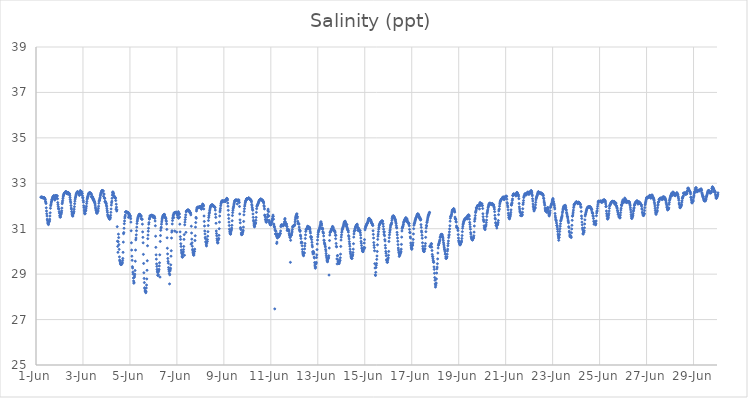
| Category | Salinity (ppt) |
|---|---|
| 44348.208333333336 | 32.39 |
| 44348.21875 | 32.39 |
| 44348.229166666664 | 32.38 |
| 44348.239583333336 | 32.39 |
| 44348.25 | 32.39 |
| 44348.260416666664 | 32.39 |
| 44348.270833333336 | 32.38 |
| 44348.28125 | 32.36 |
| 44348.291666666664 | 32.37 |
| 44348.302083333336 | 32.36 |
| 44348.3125 | 32.36 |
| 44348.322916666664 | 32.37 |
| 44348.333333333336 | 32.36 |
| 44348.34375 | 32.37 |
| 44348.354166666664 | 32.36 |
| 44348.364583333336 | 32.35 |
| 44348.375 | 32.31 |
| 44348.385416666664 | 32.31 |
| 44348.395833333336 | 32.28 |
| 44348.40625 | 32.2 |
| 44348.416666666664 | 32.17 |
| 44348.427083333336 | 32.11 |
| 44348.4375 | 31.92 |
| 44348.447916666664 | 31.78 |
| 44348.458333333336 | 31.66 |
| 44348.46875 | 31.56 |
| 44348.479166666664 | 31.42 |
| 44348.489583333336 | 31.36 |
| 44348.5 | 31.29 |
| 44348.510416666664 | 31.22 |
| 44348.520833333336 | 31.22 |
| 44348.53125 | 31.18 |
| 44348.541666666664 | 31.27 |
| 44348.552083333336 | 31.32 |
| 44348.5625 | 31.31 |
| 44348.572916666664 | 31.35 |
| 44348.583333333336 | 31.42 |
| 44348.59375 | 31.56 |
| 44348.604166666664 | 31.7 |
| 44348.614583333336 | 31.9 |
| 44348.625 | 32.01 |
| 44348.635416666664 | 32.06 |
| 44348.645833333336 | 32.13 |
| 44348.65625 | 32.18 |
| 44348.666666666664 | 32.22 |
| 44348.677083333336 | 32.28 |
| 44348.6875 | 32.28 |
| 44348.697916666664 | 32.33 |
| 44348.708333333336 | 32.38 |
| 44348.71875 | 32.39 |
| 44348.729166666664 | 32.41 |
| 44348.739583333336 | 32.43 |
| 44348.75 | 32.45 |
| 44348.760416666664 | 32.44 |
| 44348.770833333336 | 32.44 |
| 44348.78125 | 32.44 |
| 44348.791666666664 | 32.3 |
| 44348.802083333336 | 32.26 |
| 44348.8125 | 32.33 |
| 44348.822916666664 | 32.41 |
| 44348.833333333336 | 32.46 |
| 44348.84375 | 32.46 |
| 44348.854166666664 | 32.45 |
| 44348.864583333336 | 32.44 |
| 44348.875 | 32.44 |
| 44348.885416666664 | 32.34 |
| 44348.895833333336 | 32.45 |
| 44348.90625 | 32.44 |
| 44348.916666666664 | 32.32 |
| 44348.927083333336 | 32.15 |
| 44348.9375 | 32.06 |
| 44348.947916666664 | 31.97 |
| 44348.958333333336 | 31.88 |
| 44348.96875 | 31.88 |
| 44348.979166666664 | 31.87 |
| 44348.989583333336 | 31.75 |
| 44349.0 | 31.68 |
| 44349.010416666664 | 31.58 |
| 44349.020833333336 | 31.52 |
| 44349.03125 | 31.51 |
| 44349.041666666664 | 31.52 |
| 44349.052083333336 | 31.61 |
| 44349.0625 | 31.64 |
| 44349.072916666664 | 31.66 |
| 44349.083333333336 | 31.72 |
| 44349.09375 | 31.79 |
| 44349.104166666664 | 31.91 |
| 44349.114583333336 | 32.1 |
| 44349.125 | 32.17 |
| 44349.135416666664 | 32.24 |
| 44349.145833333336 | 32.33 |
| 44349.15625 | 32.4 |
| 44349.166666666664 | 32.45 |
| 44349.177083333336 | 32.49 |
| 44349.1875 | 32.52 |
| 44349.197916666664 | 32.55 |
| 44349.208333333336 | 32.56 |
| 44349.21875 | 32.58 |
| 44349.229166666664 | 32.58 |
| 44349.239583333336 | 32.6 |
| 44349.25 | 32.62 |
| 44349.260416666664 | 32.63 |
| 44349.270833333336 | 32.63 |
| 44349.28125 | 32.62 |
| 44349.291666666664 | 32.62 |
| 44349.302083333336 | 32.59 |
| 44349.3125 | 32.56 |
| 44349.322916666664 | 32.54 |
| 44349.333333333336 | 32.54 |
| 44349.34375 | 32.54 |
| 44349.354166666664 | 32.6 |
| 44349.364583333336 | 32.6 |
| 44349.375 | 32.59 |
| 44349.385416666664 | 32.57 |
| 44349.395833333336 | 32.54 |
| 44349.40625 | 32.52 |
| 44349.416666666664 | 32.55 |
| 44349.427083333336 | 32.54 |
| 44349.4375 | 32.47 |
| 44349.447916666664 | 32.38 |
| 44349.458333333336 | 32.29 |
| 44349.46875 | 32.21 |
| 44349.479166666664 | 32.14 |
| 44349.489583333336 | 32.02 |
| 44349.5 | 31.91 |
| 44349.510416666664 | 31.86 |
| 44349.520833333336 | 31.76 |
| 44349.53125 | 31.69 |
| 44349.541666666664 | 31.63 |
| 44349.552083333336 | 31.58 |
| 44349.5625 | 31.56 |
| 44349.572916666664 | 31.56 |
| 44349.583333333336 | 31.65 |
| 44349.59375 | 31.69 |
| 44349.604166666664 | 31.7 |
| 44349.614583333336 | 31.76 |
| 44349.625 | 31.86 |
| 44349.635416666664 | 31.97 |
| 44349.645833333336 | 32.1 |
| 44349.65625 | 32.21 |
| 44349.666666666664 | 32.3 |
| 44349.677083333336 | 32.36 |
| 44349.6875 | 32.4 |
| 44349.697916666664 | 32.45 |
| 44349.708333333336 | 32.5 |
| 44349.71875 | 32.54 |
| 44349.729166666664 | 32.56 |
| 44349.739583333336 | 32.57 |
| 44349.75 | 32.59 |
| 44349.760416666664 | 32.63 |
| 44349.770833333336 | 32.62 |
| 44349.78125 | 32.62 |
| 44349.791666666664 | 32.6 |
| 44349.802083333336 | 32.59 |
| 44349.8125 | 32.56 |
| 44349.822916666664 | 32.55 |
| 44349.833333333336 | 32.54 |
| 44349.84375 | 32.47 |
| 44349.854166666664 | 32.48 |
| 44349.864583333336 | 32.6 |
| 44349.875 | 32.62 |
| 44349.885416666664 | 32.68 |
| 44349.895833333336 | 32.64 |
| 44349.90625 | 32.65 |
| 44349.916666666664 | 32.6 |
| 44349.927083333336 | 32.6 |
| 44349.9375 | 32.53 |
| 44349.947916666664 | 32.56 |
| 44349.958333333336 | 32.62 |
| 44349.96875 | 32.55 |
| 44349.979166666664 | 32.45 |
| 44349.989583333336 | 32.36 |
| 44350.0 | 32.36 |
| 44350.010416666664 | 32.25 |
| 44350.020833333336 | 32.17 |
| 44350.03125 | 32.01 |
| 44350.041666666664 | 31.93 |
| 44350.052083333336 | 31.82 |
| 44350.0625 | 31.74 |
| 44350.072916666664 | 31.67 |
| 44350.083333333336 | 31.65 |
| 44350.09375 | 31.68 |
| 44350.104166666664 | 31.78 |
| 44350.114583333336 | 31.79 |
| 44350.125 | 31.82 |
| 44350.135416666664 | 31.91 |
| 44350.145833333336 | 31.99 |
| 44350.15625 | 32.11 |
| 44350.166666666664 | 32.2 |
| 44350.177083333336 | 32.3 |
| 44350.1875 | 32.34 |
| 44350.197916666664 | 32.39 |
| 44350.208333333336 | 32.42 |
| 44350.21875 | 32.46 |
| 44350.229166666664 | 32.5 |
| 44350.239583333336 | 32.53 |
| 44350.25 | 32.56 |
| 44350.260416666664 | 32.57 |
| 44350.270833333336 | 32.58 |
| 44350.28125 | 32.57 |
| 44350.291666666664 | 32.58 |
| 44350.302083333336 | 32.58 |
| 44350.3125 | 32.57 |
| 44350.322916666664 | 32.56 |
| 44350.333333333336 | 32.56 |
| 44350.34375 | 32.55 |
| 44350.354166666664 | 32.41 |
| 44350.364583333336 | 32.5 |
| 44350.375 | 32.4 |
| 44350.385416666664 | 32.42 |
| 44350.395833333336 | 32.36 |
| 44350.40625 | 32.41 |
| 44350.416666666664 | 32.37 |
| 44350.427083333336 | 32.29 |
| 44350.4375 | 32.32 |
| 44350.447916666664 | 32.25 |
| 44350.458333333336 | 32.29 |
| 44350.46875 | 32.23 |
| 44350.479166666664 | 32.19 |
| 44350.489583333336 | 32.2 |
| 44350.5 | 32.15 |
| 44350.510416666664 | 32.1 |
| 44350.520833333336 | 32.04 |
| 44350.53125 | 31.95 |
| 44350.541666666664 | 31.89 |
| 44350.552083333336 | 31.83 |
| 44350.5625 | 31.81 |
| 44350.572916666664 | 31.74 |
| 44350.583333333336 | 31.7 |
| 44350.59375 | 31.68 |
| 44350.604166666664 | 31.69 |
| 44350.614583333336 | 31.74 |
| 44350.625 | 31.76 |
| 44350.635416666664 | 31.77 |
| 44350.645833333336 | 31.82 |
| 44350.65625 | 31.9 |
| 44350.666666666664 | 31.99 |
| 44350.677083333336 | 32.12 |
| 44350.6875 | 32.21 |
| 44350.697916666664 | 32.24 |
| 44350.708333333336 | 32.27 |
| 44350.71875 | 32.33 |
| 44350.729166666664 | 32.38 |
| 44350.739583333336 | 32.45 |
| 44350.75 | 32.5 |
| 44350.760416666664 | 32.55 |
| 44350.770833333336 | 32.59 |
| 44350.78125 | 32.61 |
| 44350.791666666664 | 32.62 |
| 44350.802083333336 | 32.67 |
| 44350.8125 | 32.68 |
| 44350.822916666664 | 32.68 |
| 44350.833333333336 | 32.67 |
| 44350.84375 | 32.67 |
| 44350.854166666664 | 32.66 |
| 44350.864583333336 | 32.66 |
| 44350.875 | 32.43 |
| 44350.885416666664 | 32.54 |
| 44350.895833333336 | 32.52 |
| 44350.90625 | 32.35 |
| 44350.916666666664 | 32.35 |
| 44350.927083333336 | 32.33 |
| 44350.9375 | 32.19 |
| 44350.947916666664 | 32.21 |
| 44350.958333333336 | 32.17 |
| 44350.96875 | 32.15 |
| 44350.979166666664 | 32.13 |
| 44350.989583333336 | 32.1 |
| 44351.0 | 32.03 |
| 44351.010416666664 | 31.97 |
| 44351.020833333336 | 31.88 |
| 44351.03125 | 31.79 |
| 44351.041666666664 | 31.72 |
| 44351.052083333336 | 31.62 |
| 44351.0625 | 31.57 |
| 44351.072916666664 | 31.55 |
| 44351.083333333336 | 31.53 |
| 44351.09375 | 31.52 |
| 44351.104166666664 | 31.48 |
| 44351.114583333336 | 31.45 |
| 44351.125 | 31.43 |
| 44351.135416666664 | 31.43 |
| 44351.145833333336 | 31.42 |
| 44351.15625 | 31.46 |
| 44351.166666666664 | 31.5 |
| 44351.177083333336 | 31.59 |
| 44351.1875 | 31.72 |
| 44351.197916666664 | 31.87 |
| 44351.208333333336 | 32.04 |
| 44351.21875 | 32.14 |
| 44351.229166666664 | 32.21 |
| 44351.239583333336 | 32.34 |
| 44351.25 | 32.48 |
| 44351.260416666664 | 32.58 |
| 44351.270833333336 | 32.62 |
| 44351.28125 | 32.61 |
| 44351.291666666664 | 32.57 |
| 44351.302083333336 | 32.54 |
| 44351.3125 | 32.46 |
| 44351.322916666664 | 32.43 |
| 44351.333333333336 | 32.42 |
| 44351.34375 | 32.41 |
| 44351.354166666664 | 32.38 |
| 44351.364583333336 | 32.38 |
| 44351.375 | 32.37 |
| 44351.385416666664 | 32.34 |
| 44351.395833333336 | 32.24 |
| 44351.40625 | 31.86 |
| 44351.416666666664 | 32.08 |
| 44351.427083333336 | 31.95 |
| 44351.4375 | 31.78 |
| 44351.447916666664 | 31.83 |
| 44351.458333333336 | 31.09 |
| 44351.46875 | 30.45 |
| 44351.479166666664 | 30.22 |
| 44351.489583333336 | 29.96 |
| 44351.5 | 30.43 |
| 44351.510416666664 | 30.76 |
| 44351.520833333336 | 30.61 |
| 44351.53125 | 30.3 |
| 44351.541666666664 | 30.09 |
| 44351.552083333336 | 29.76 |
| 44351.5625 | 29.62 |
| 44351.572916666664 | 29.58 |
| 44351.583333333336 | 29.54 |
| 44351.59375 | 29.48 |
| 44351.604166666664 | 29.45 |
| 44351.614583333336 | 29.42 |
| 44351.625 | 29.43 |
| 44351.635416666664 | 29.43 |
| 44351.645833333336 | 29.43 |
| 44351.65625 | 29.47 |
| 44351.666666666664 | 29.48 |
| 44351.677083333336 | 29.52 |
| 44351.6875 | 29.6 |
| 44351.697916666664 | 29.69 |
| 44351.708333333336 | 29.96 |
| 44351.71875 | 30.41 |
| 44351.729166666664 | 30.78 |
| 44351.739583333336 | 30.83 |
| 44351.75 | 31.02 |
| 44351.760416666664 | 31.22 |
| 44351.770833333336 | 31.34 |
| 44351.78125 | 31.47 |
| 44351.791666666664 | 31.53 |
| 44351.802083333336 | 31.6 |
| 44351.8125 | 31.73 |
| 44351.822916666664 | 31.75 |
| 44351.833333333336 | 31.74 |
| 44351.84375 | 31.74 |
| 44351.854166666664 | 31.73 |
| 44351.864583333336 | 31.73 |
| 44351.875 | 31.73 |
| 44351.885416666664 | 31.72 |
| 44351.895833333336 | 31.72 |
| 44351.90625 | 31.72 |
| 44351.916666666664 | 31.71 |
| 44351.927083333336 | 31.71 |
| 44351.9375 | 31.5 |
| 44351.947916666664 | 31.61 |
| 44351.958333333336 | 31.65 |
| 44351.96875 | 31.66 |
| 44351.979166666664 | 31.56 |
| 44351.989583333336 | 31.6 |
| 44352.0 | 31.58 |
| 44352.010416666664 | 31.58 |
| 44352.020833333336 | 31.52 |
| 44352.03125 | 31.44 |
| 44352.041666666664 | 31.29 |
| 44352.052083333336 | 30.91 |
| 44352.0625 | 30.38 |
| 44352.072916666664 | 30.06 |
| 44352.083333333336 | 29.79 |
| 44352.09375 | 29.61 |
| 44352.104166666664 | 29.33 |
| 44352.114583333336 | 29.27 |
| 44352.125 | 29.09 |
| 44352.135416666664 | 29 |
| 44352.145833333336 | 28.83 |
| 44352.15625 | 28.7 |
| 44352.166666666664 | 28.6 |
| 44352.177083333336 | 28.64 |
| 44352.1875 | 28.86 |
| 44352.197916666664 | 28.92 |
| 44352.208333333336 | 29 |
| 44352.21875 | 29.16 |
| 44352.229166666664 | 29.57 |
| 44352.239583333336 | 30.06 |
| 44352.25 | 30.51 |
| 44352.260416666664 | 30.59 |
| 44352.270833333336 | 30.73 |
| 44352.28125 | 30.91 |
| 44352.291666666664 | 31.07 |
| 44352.302083333336 | 31.23 |
| 44352.3125 | 31.33 |
| 44352.322916666664 | 31.39 |
| 44352.333333333336 | 31.46 |
| 44352.34375 | 31.48 |
| 44352.354166666664 | 31.53 |
| 44352.364583333336 | 31.55 |
| 44352.375 | 31.58 |
| 44352.385416666664 | 31.61 |
| 44352.395833333336 | 31.63 |
| 44352.40625 | 31.63 |
| 44352.416666666664 | 31.63 |
| 44352.427083333336 | 31.63 |
| 44352.4375 | 31.56 |
| 44352.447916666664 | 31.58 |
| 44352.458333333336 | 31.57 |
| 44352.46875 | 31.55 |
| 44352.479166666664 | 31.56 |
| 44352.489583333336 | 31.44 |
| 44352.5 | 31.43 |
| 44352.510416666664 | 31.43 |
| 44352.520833333336 | 31.41 |
| 44352.53125 | 31.2 |
| 44352.541666666664 | 30.86 |
| 44352.552083333336 | 30.62 |
| 44352.5625 | 30.38 |
| 44352.572916666664 | 29.87 |
| 44352.583333333336 | 29.47 |
| 44352.59375 | 29.06 |
| 44352.604166666664 | 28.81 |
| 44352.614583333336 | 28.63 |
| 44352.625 | 28.4 |
| 44352.635416666664 | 28.36 |
| 44352.645833333336 | 28.26 |
| 44352.65625 | 28.25 |
| 44352.666666666664 | 28.22 |
| 44352.677083333336 | 28.18 |
| 44352.6875 | 28.24 |
| 44352.697916666664 | 28.39 |
| 44352.708333333336 | 28.52 |
| 44352.71875 | 28.79 |
| 44352.729166666664 | 29.17 |
| 44352.739583333336 | 29.59 |
| 44352.75 | 30.25 |
| 44352.760416666664 | 30.56 |
| 44352.770833333336 | 30.72 |
| 44352.78125 | 30.89 |
| 44352.791666666664 | 31.02 |
| 44352.802083333336 | 31.2 |
| 44352.8125 | 31.27 |
| 44352.822916666664 | 31.43 |
| 44352.833333333336 | 31.43 |
| 44352.84375 | 31.5 |
| 44352.854166666664 | 31.57 |
| 44352.864583333336 | 31.55 |
| 44352.875 | 31.55 |
| 44352.885416666664 | 31.57 |
| 44352.895833333336 | 31.58 |
| 44352.90625 | 31.58 |
| 44352.916666666664 | 31.59 |
| 44352.927083333336 | 31.59 |
| 44352.9375 | 31.59 |
| 44352.947916666664 | 31.59 |
| 44352.958333333336 | 31.57 |
| 44352.96875 | 31.53 |
| 44352.979166666664 | 31.53 |
| 44352.989583333336 | 31.5 |
| 44353.0 | 31.54 |
| 44353.010416666664 | 31.57 |
| 44353.020833333336 | 31.52 |
| 44353.03125 | 31.51 |
| 44353.041666666664 | 31.54 |
| 44353.052083333336 | 31.47 |
| 44353.0625 | 31.46 |
| 44353.072916666664 | 31.34 |
| 44353.083333333336 | 31.13 |
| 44353.09375 | 30.67 |
| 44353.104166666664 | 30.18 |
| 44353.114583333336 | 29.85 |
| 44353.125 | 29.66 |
| 44353.135416666664 | 29.45 |
| 44353.145833333336 | 29.34 |
| 44353.15625 | 29.21 |
| 44353.166666666664 | 29.13 |
| 44353.177083333336 | 29.07 |
| 44353.1875 | 28.95 |
| 44353.197916666664 | 28.94 |
| 44353.208333333336 | 28.98 |
| 44353.21875 | 29.11 |
| 44353.229166666664 | 29.18 |
| 44353.239583333336 | 29.21 |
| 44353.25 | 29.36 |
| 44353.260416666664 | 29.5 |
| 44353.270833333336 | 29.85 |
| 44353.28125 | 28.87 |
| 44353.291666666664 | 30.44 |
| 44353.302083333336 | 30.7 |
| 44353.3125 | 30.93 |
| 44353.322916666664 | 31.03 |
| 44353.333333333336 | 31.07 |
| 44353.34375 | 31.2 |
| 44353.354166666664 | 31.3 |
| 44353.364583333336 | 31.38 |
| 44353.375 | 31.44 |
| 44353.385416666664 | 31.49 |
| 44353.395833333336 | 31.53 |
| 44353.40625 | 31.56 |
| 44353.416666666664 | 31.58 |
| 44353.427083333336 | 31.6 |
| 44353.4375 | 31.61 |
| 44353.447916666664 | 31.61 |
| 44353.458333333336 | 31.63 |
| 44353.46875 | 31.63 |
| 44353.479166666664 | 31.61 |
| 44353.489583333336 | 31.54 |
| 44353.5 | 31.51 |
| 44353.510416666664 | 31.48 |
| 44353.520833333336 | 31.48 |
| 44353.53125 | 31.45 |
| 44353.541666666664 | 31.37 |
| 44353.552083333336 | 31.32 |
| 44353.5625 | 31.21 |
| 44353.572916666664 | 30.97 |
| 44353.583333333336 | 30.6 |
| 44353.59375 | 30.14 |
| 44353.604166666664 | 29.89 |
| 44353.614583333336 | 29.69 |
| 44353.625 | 29.56 |
| 44353.635416666664 | 29.48 |
| 44353.645833333336 | 29.29 |
| 44353.65625 | 29.2 |
| 44353.666666666664 | 29.13 |
| 44353.677083333336 | 29.03 |
| 44353.6875 | 28.57 |
| 44353.697916666664 | 28.97 |
| 44353.708333333336 | 29.14 |
| 44353.71875 | 29.19 |
| 44353.729166666664 | 29.26 |
| 44353.739583333336 | 29.41 |
| 44353.75 | 29.79 |
| 44353.760416666664 | 30.03 |
| 44353.770833333336 | 30.59 |
| 44353.78125 | 30.85 |
| 44353.791666666664 | 30.91 |
| 44353.802083333336 | 31.21 |
| 44353.8125 | 31.36 |
| 44353.822916666664 | 31.46 |
| 44353.833333333336 | 31.51 |
| 44353.84375 | 31.57 |
| 44353.854166666664 | 31.62 |
| 44353.864583333336 | 31.49 |
| 44353.875 | 31.67 |
| 44353.885416666664 | 31.7 |
| 44353.895833333336 | 31.7 |
| 44353.90625 | 30.9 |
| 44353.916666666664 | 31.7 |
| 44353.927083333336 | 31.71 |
| 44353.9375 | 31.71 |
| 44353.947916666664 | 31.72 |
| 44353.958333333336 | 31.72 |
| 44353.96875 | 31.73 |
| 44353.979166666664 | 31.72 |
| 44353.989583333336 | 30.85 |
| 44354.0 | 31.66 |
| 44354.010416666664 | 31.64 |
| 44354.020833333336 | 31.59 |
| 44354.03125 | 31.5 |
| 44354.041666666664 | 31.68 |
| 44354.052083333336 | 31.6 |
| 44354.0625 | 31.75 |
| 44354.072916666664 | 31.46 |
| 44354.083333333336 | 31.66 |
| 44354.09375 | 31.68 |
| 44354.104166666664 | 31.64 |
| 44354.114583333336 | 31.51 |
| 44354.125 | 31.2 |
| 44354.135416666664 | 30.86 |
| 44354.145833333336 | 30.65 |
| 44354.15625 | 30.53 |
| 44354.166666666664 | 30.34 |
| 44354.177083333336 | 30.22 |
| 44354.1875 | 30.06 |
| 44354.197916666664 | 29.97 |
| 44354.208333333336 | 29.9 |
| 44354.21875 | 29.79 |
| 44354.229166666664 | 29.75 |
| 44354.239583333336 | 29.75 |
| 44354.25 | 29.87 |
| 44354.260416666664 | 29.95 |
| 44354.270833333336 | 29.99 |
| 44354.28125 | 30.08 |
| 44354.291666666664 | 30.22 |
| 44354.302083333336 | 30.53 |
| 44354.3125 | 30.74 |
| 44354.322916666664 | 29.83 |
| 44354.333333333336 | 31.17 |
| 44354.34375 | 31.29 |
| 44354.354166666664 | 31.4 |
| 44354.364583333336 | 31.5 |
| 44354.375 | 31.61 |
| 44354.385416666664 | 30.84 |
| 44354.395833333336 | 31.74 |
| 44354.40625 | 31.77 |
| 44354.416666666664 | 31.79 |
| 44354.427083333336 | 31.8 |
| 44354.4375 | 31.81 |
| 44354.447916666664 | 31.81 |
| 44354.458333333336 | 31.82 |
| 44354.46875 | 31.82 |
| 44354.479166666664 | 31.82 |
| 44354.489583333336 | 31.82 |
| 44354.5 | 31.81 |
| 44354.510416666664 | 31.79 |
| 44354.520833333336 | 31.78 |
| 44354.53125 | 31.76 |
| 44354.541666666664 | 31.76 |
| 44354.552083333336 | 31.71 |
| 44354.5625 | 31.7 |
| 44354.572916666664 | 31.71 |
| 44354.583333333336 | 31.68 |
| 44354.59375 | 31.61 |
| 44354.604166666664 | 30.32 |
| 44354.614583333336 | 31.11 |
| 44354.625 | 30.81 |
| 44354.635416666664 | 30.54 |
| 44354.645833333336 | 30.38 |
| 44354.65625 | 30.23 |
| 44354.666666666664 | 30.09 |
| 44354.677083333336 | 30.03 |
| 44354.6875 | 29.96 |
| 44354.697916666664 | 29.9 |
| 44354.708333333336 | 29.85 |
| 44354.71875 | 29.83 |
| 44354.729166666664 | 29.89 |
| 44354.739583333336 | 30 |
| 44354.75 | 30 |
| 44354.760416666664 | 30.1 |
| 44354.770833333336 | 30.48 |
| 44354.78125 | 30.69 |
| 44354.791666666664 | 31.07 |
| 44354.802083333336 | 31.27 |
| 44354.8125 | 31.5 |
| 44354.822916666664 | 31.46 |
| 44354.833333333336 | 31.78 |
| 44354.84375 | 31.85 |
| 44354.854166666664 | 31.9 |
| 44354.864583333336 | 31.93 |
| 44354.875 | 31.93 |
| 44354.885416666664 | 31.95 |
| 44354.895833333336 | 31.94 |
| 44354.90625 | 31.95 |
| 44354.916666666664 | 31.94 |
| 44354.927083333336 | 31.95 |
| 44354.9375 | 31.94 |
| 44354.947916666664 | 31.94 |
| 44354.958333333336 | 31.95 |
| 44354.96875 | 31.96 |
| 44354.979166666664 | 31.97 |
| 44354.989583333336 | 31.97 |
| 44355.0 | 31.98 |
| 44355.010416666664 | 31.97 |
| 44355.020833333336 | 31.96 |
| 44355.03125 | 31.96 |
| 44355.041666666664 | 31.86 |
| 44355.052083333336 | 31.88 |
| 44355.0625 | 31.96 |
| 44355.072916666664 | 32.01 |
| 44355.083333333336 | 31.97 |
| 44355.09375 | 32.08 |
| 44355.104166666664 | 32.08 |
| 44355.114583333336 | 32.04 |
| 44355.125 | 32.04 |
| 44355.135416666664 | 32 |
| 44355.145833333336 | 31.87 |
| 44355.15625 | 31.56 |
| 44355.166666666664 | 31.32 |
| 44355.177083333336 | 31.12 |
| 44355.1875 | 30.9 |
| 44355.197916666664 | 30.77 |
| 44355.208333333336 | 30.62 |
| 44355.21875 | 30.56 |
| 44355.229166666664 | 30.43 |
| 44355.239583333336 | 30.39 |
| 44355.25 | 30.29 |
| 44355.260416666664 | 30.24 |
| 44355.270833333336 | 30.36 |
| 44355.28125 | 30.43 |
| 44355.291666666664 | 30.43 |
| 44355.302083333336 | 30.52 |
| 44355.3125 | 30.67 |
| 44355.322916666664 | 30.87 |
| 44355.333333333336 | 31.14 |
| 44355.34375 | 31.36 |
| 44355.354166666664 | 31.49 |
| 44355.364583333336 | 31.57 |
| 44355.375 | 31.66 |
| 44355.385416666664 | 31.71 |
| 44355.395833333336 | 31.79 |
| 44355.40625 | 31.86 |
| 44355.416666666664 | 31.91 |
| 44355.427083333336 | 31.95 |
| 44355.4375 | 31.98 |
| 44355.447916666664 | 32.01 |
| 44355.458333333336 | 32.03 |
| 44355.46875 | 32.04 |
| 44355.479166666664 | 32.04 |
| 44355.489583333336 | 32.04 |
| 44355.5 | 32.04 |
| 44355.510416666664 | 32.05 |
| 44355.520833333336 | 32.05 |
| 44355.53125 | 32.02 |
| 44355.541666666664 | 32.01 |
| 44355.552083333336 | 31.99 |
| 44355.5625 | 31.98 |
| 44355.572916666664 | 32 |
| 44355.583333333336 | 31.98 |
| 44355.59375 | 31.97 |
| 44355.604166666664 | 31.95 |
| 44355.614583333336 | 31.95 |
| 44355.625 | 31.93 |
| 44355.635416666664 | 31.82 |
| 44355.645833333336 | 31.64 |
| 44355.65625 | 31.5 |
| 44355.666666666664 | 31.24 |
| 44355.677083333336 | 30.9 |
| 44355.6875 | 30.79 |
| 44355.697916666664 | 30.69 |
| 44355.708333333336 | 30.56 |
| 44355.71875 | 30.48 |
| 44355.729166666664 | 30.4 |
| 44355.739583333336 | 30.37 |
| 44355.75 | 30.38 |
| 44355.760416666664 | 30.5 |
| 44355.770833333336 | 30.55 |
| 44355.78125 | 30.57 |
| 44355.791666666664 | 30.71 |
| 44355.802083333336 | 31 |
| 44355.8125 | 31.29 |
| 44355.822916666664 | 31.56 |
| 44355.833333333336 | 31.74 |
| 44355.84375 | 31.82 |
| 44355.854166666664 | 31.9 |
| 44355.864583333336 | 32.01 |
| 44355.875 | 32.09 |
| 44355.885416666664 | 32.13 |
| 44355.895833333336 | 32.17 |
| 44355.90625 | 32.19 |
| 44355.916666666664 | 32.22 |
| 44355.927083333336 | 32.23 |
| 44355.9375 | 32.22 |
| 44355.947916666664 | 32.22 |
| 44355.958333333336 | 32.21 |
| 44355.96875 | 32.21 |
| 44355.979166666664 | 32.21 |
| 44355.989583333336 | 32.21 |
| 44356.0 | 32.22 |
| 44356.010416666664 | 32.22 |
| 44356.020833333336 | 32.22 |
| 44356.03125 | 32.22 |
| 44356.041666666664 | 32.22 |
| 44356.052083333336 | 32.21 |
| 44356.0625 | 32.2 |
| 44356.072916666664 | 32.21 |
| 44356.083333333336 | 32.26 |
| 44356.09375 | 32.27 |
| 44356.104166666664 | 32.28 |
| 44356.114583333336 | 32.31 |
| 44356.125 | 32.34 |
| 44356.135416666664 | 32.29 |
| 44356.145833333336 | 32.32 |
| 44356.15625 | 32.26 |
| 44356.166666666664 | 32.13 |
| 44356.177083333336 | 31.99 |
| 44356.1875 | 31.81 |
| 44356.197916666664 | 31.61 |
| 44356.208333333336 | 31.45 |
| 44356.21875 | 31.29 |
| 44356.229166666664 | 31.14 |
| 44356.239583333336 | 30.98 |
| 44356.25 | 30.89 |
| 44356.260416666664 | 30.82 |
| 44356.270833333336 | 30.79 |
| 44356.28125 | 30.76 |
| 44356.291666666664 | 30.77 |
| 44356.302083333336 | 30.86 |
| 44356.3125 | 30.92 |
| 44356.322916666664 | 30.96 |
| 44356.333333333336 | 31.03 |
| 44356.34375 | 31.15 |
| 44356.354166666664 | 31.35 |
| 44356.364583333336 | 31.58 |
| 44356.375 | 31.71 |
| 44356.385416666664 | 31.81 |
| 44356.395833333336 | 31.88 |
| 44356.40625 | 31.94 |
| 44356.416666666664 | 31.99 |
| 44356.427083333336 | 32.05 |
| 44356.4375 | 32.1 |
| 44356.447916666664 | 32.16 |
| 44356.458333333336 | 32.21 |
| 44356.46875 | 32.23 |
| 44356.479166666664 | 32.25 |
| 44356.489583333336 | 32.26 |
| 44356.5 | 32.26 |
| 44356.510416666664 | 32.25 |
| 44356.520833333336 | 32.26 |
| 44356.53125 | 32.26 |
| 44356.541666666664 | 32.26 |
| 44356.552083333336 | 32.24 |
| 44356.5625 | 32.23 |
| 44356.572916666664 | 32.09 |
| 44356.583333333336 | 32.26 |
| 44356.59375 | 32.22 |
| 44356.604166666664 | 32.26 |
| 44356.614583333336 | 32.25 |
| 44356.625 | 32.24 |
| 44356.635416666664 | 32.27 |
| 44356.645833333336 | 32.22 |
| 44356.65625 | 32.15 |
| 44356.666666666664 | 31.98 |
| 44356.677083333336 | 31.65 |
| 44356.6875 | 31.39 |
| 44356.697916666664 | 31.26 |
| 44356.708333333336 | 31.05 |
| 44356.71875 | 31 |
| 44356.729166666664 | 30.96 |
| 44356.739583333336 | 30.81 |
| 44356.75 | 30.74 |
| 44356.760416666664 | 30.74 |
| 44356.770833333336 | 30.75 |
| 44356.78125 | 30.76 |
| 44356.791666666664 | 30.81 |
| 44356.802083333336 | 30.86 |
| 44356.8125 | 30.86 |
| 44356.822916666664 | 30.93 |
| 44356.833333333336 | 31.07 |
| 44356.84375 | 31.32 |
| 44356.854166666664 | 31.61 |
| 44356.864583333336 | 31.76 |
| 44356.875 | 31.88 |
| 44356.885416666664 | 31.99 |
| 44356.895833333336 | 32.05 |
| 44356.90625 | 32.13 |
| 44356.916666666664 | 32.17 |
| 44356.927083333336 | 32.22 |
| 44356.9375 | 32.24 |
| 44356.947916666664 | 32.26 |
| 44356.958333333336 | 32.3 |
| 44356.96875 | 32.32 |
| 44356.979166666664 | 32.32 |
| 44356.989583333336 | 32.32 |
| 44357.0 | 32.31 |
| 44357.010416666664 | 32.31 |
| 44357.020833333336 | 32.32 |
| 44357.03125 | 32.33 |
| 44357.041666666664 | 32.34 |
| 44357.052083333336 | 32.35 |
| 44357.0625 | 32.36 |
| 44357.072916666664 | 32.33 |
| 44357.083333333336 | 32.33 |
| 44357.09375 | 32.31 |
| 44357.104166666664 | 32.29 |
| 44357.114583333336 | 32.3 |
| 44357.125 | 32.28 |
| 44357.135416666664 | 32.29 |
| 44357.145833333336 | 32.27 |
| 44357.15625 | 32.25 |
| 44357.166666666664 | 32.22 |
| 44357.177083333336 | 32.18 |
| 44357.1875 | 32.07 |
| 44357.197916666664 | 32.01 |
| 44357.208333333336 | 31.93 |
| 44357.21875 | 31.86 |
| 44357.229166666664 | 31.81 |
| 44357.239583333336 | 31.65 |
| 44357.25 | 31.5 |
| 44357.260416666664 | 31.37 |
| 44357.270833333336 | 31.31 |
| 44357.28125 | 31.21 |
| 44357.291666666664 | 31.14 |
| 44357.302083333336 | 31.08 |
| 44357.3125 | 31.11 |
| 44357.322916666664 | 31.19 |
| 44357.333333333336 | 31.23 |
| 44357.34375 | 31.23 |
| 44357.354166666664 | 31.26 |
| 44357.364583333336 | 31.37 |
| 44357.375 | 31.5 |
| 44357.385416666664 | 31.72 |
| 44357.395833333336 | 31.88 |
| 44357.40625 | 31.98 |
| 44357.416666666664 | 32.01 |
| 44357.427083333336 | 32.04 |
| 44357.4375 | 32.05 |
| 44357.447916666664 | 32.08 |
| 44357.458333333336 | 32.11 |
| 44357.46875 | 32.14 |
| 44357.479166666664 | 32.16 |
| 44357.489583333336 | 32.2 |
| 44357.5 | 32.22 |
| 44357.510416666664 | 32.24 |
| 44357.520833333336 | 32.26 |
| 44357.53125 | 32.27 |
| 44357.541666666664 | 32.28 |
| 44357.552083333336 | 32.29 |
| 44357.5625 | 32.3 |
| 44357.572916666664 | 32.31 |
| 44357.583333333336 | 32.3 |
| 44357.59375 | 32.28 |
| 44357.604166666664 | 32.27 |
| 44357.614583333336 | 32.27 |
| 44357.625 | 32.26 |
| 44357.635416666664 | 32.26 |
| 44357.645833333336 | 32.25 |
| 44357.65625 | 32.22 |
| 44357.666666666664 | 32.22 |
| 44357.677083333336 | 32.2 |
| 44357.6875 | 32.17 |
| 44357.697916666664 | 32.13 |
| 44357.708333333336 | 32.02 |
| 44357.71875 | 31.97 |
| 44357.729166666664 | 31.87 |
| 44357.739583333336 | 31.6 |
| 44357.75 | 31.59 |
| 44357.760416666664 | 31.52 |
| 44357.770833333336 | 31.41 |
| 44357.78125 | 31.39 |
| 44357.791666666664 | 31.33 |
| 44357.802083333336 | 31.29 |
| 44357.8125 | 31.29 |
| 44357.822916666664 | 31.39 |
| 44357.833333333336 | 31.37 |
| 44357.84375 | 31.39 |
| 44357.854166666664 | 31.51 |
| 44357.864583333336 | 31.63 |
| 44357.875 | 31.79 |
| 44357.885416666664 | 31.86 |
| 44357.895833333336 | 31.56 |
| 44357.90625 | 31.75 |
| 44357.916666666664 | 31.56 |
| 44357.927083333336 | 31.37 |
| 44357.9375 | 31.3 |
| 44357.947916666664 | 31.26 |
| 44357.958333333336 | 31.23 |
| 44357.96875 | 31.2 |
| 44357.979166666664 | 31.17 |
| 44357.989583333336 | 31.18 |
| 44358.0 | 31.18 |
| 44358.010416666664 | 31.18 |
| 44358.020833333336 | 31.24 |
| 44358.03125 | 31.29 |
| 44358.041666666664 | 31.31 |
| 44358.052083333336 | 31.36 |
| 44358.0625 | 31.42 |
| 44358.072916666664 | 31.46 |
| 44358.083333333336 | 31.54 |
| 44358.09375 | 31.6 |
| 44358.104166666664 | 31.54 |
| 44358.114583333336 | 31.42 |
| 44358.125 | 31.21 |
| 44358.135416666664 | 31.16 |
| 44358.145833333336 | 31.09 |
| 44358.15625 | 31.07 |
| 44358.166666666664 | 27.47 |
| 44358.177083333336 | 30.98 |
| 44358.1875 | 30.92 |
| 44358.197916666664 | 30.77 |
| 44358.208333333336 | 30.77 |
| 44358.21875 | 30.89 |
| 44358.229166666664 | 30.77 |
| 44358.239583333336 | 30.68 |
| 44358.25 | 30.35 |
| 44358.260416666664 | 30.41 |
| 44358.270833333336 | 30.62 |
| 44358.28125 | 30.59 |
| 44358.291666666664 | 30.77 |
| 44358.302083333336 | 30.7 |
| 44358.3125 | 30.64 |
| 44358.322916666664 | 30.68 |
| 44358.333333333336 | 30.65 |
| 44358.34375 | 30.65 |
| 44358.354166666664 | 30.69 |
| 44358.364583333336 | 30.72 |
| 44358.375 | 30.74 |
| 44358.385416666664 | 30.77 |
| 44358.395833333336 | 30.79 |
| 44358.40625 | 30.79 |
| 44358.416666666664 | 30.9 |
| 44358.427083333336 | 31.09 |
| 44358.4375 | 31.13 |
| 44358.447916666664 | 31.17 |
| 44358.458333333336 | 31.16 |
| 44358.46875 | 31.16 |
| 44358.479166666664 | 31.16 |
| 44358.489583333336 | 31.16 |
| 44358.5 | 31.14 |
| 44358.510416666664 | 31.13 |
| 44358.520833333336 | 31.13 |
| 44358.53125 | 31.13 |
| 44358.541666666664 | 31.15 |
| 44358.552083333336 | 31.18 |
| 44358.5625 | 31.2 |
| 44358.572916666664 | 31.24 |
| 44358.583333333336 | 31.31 |
| 44358.59375 | 31.41 |
| 44358.604166666664 | 31.45 |
| 44358.614583333336 | 31.32 |
| 44358.625 | 31.25 |
| 44358.635416666664 | 31.19 |
| 44358.645833333336 | 31.22 |
| 44358.65625 | 31.17 |
| 44358.666666666664 | 31.21 |
| 44358.677083333336 | 31.1 |
| 44358.6875 | 31.1 |
| 44358.697916666664 | 30.92 |
| 44358.708333333336 | 30.99 |
| 44358.71875 | 30.97 |
| 44358.729166666664 | 30.93 |
| 44358.739583333336 | 30.93 |
| 44358.75 | 30.97 |
| 44358.760416666664 | 30.9 |
| 44358.770833333336 | 30.91 |
| 44358.78125 | 30.79 |
| 44358.791666666664 | 30.73 |
| 44358.802083333336 | 30.69 |
| 44358.8125 | 30.63 |
| 44358.822916666664 | 30.61 |
| 44358.833333333336 | 29.52 |
| 44358.84375 | 30.49 |
| 44358.854166666664 | 30.69 |
| 44358.864583333336 | 30.71 |
| 44358.875 | 30.72 |
| 44358.885416666664 | 30.77 |
| 44358.895833333336 | 30.83 |
| 44358.90625 | 30.89 |
| 44358.916666666664 | 30.97 |
| 44358.927083333336 | 31.07 |
| 44358.9375 | 31.1 |
| 44358.947916666664 | 31.12 |
| 44358.958333333336 | 31.11 |
| 44358.96875 | 31.12 |
| 44358.979166666664 | 31.13 |
| 44358.989583333336 | 31.13 |
| 44359.0 | 31.13 |
| 44359.010416666664 | 31.15 |
| 44359.020833333336 | 31.19 |
| 44359.03125 | 31.3 |
| 44359.041666666664 | 31.39 |
| 44359.052083333336 | 31.47 |
| 44359.0625 | 31.52 |
| 44359.072916666664 | 31.56 |
| 44359.083333333336 | 31.57 |
| 44359.09375 | 31.62 |
| 44359.104166666664 | 31.65 |
| 44359.114583333336 | 31.65 |
| 44359.125 | 31.47 |
| 44359.135416666664 | 31.53 |
| 44359.145833333336 | 31.33 |
| 44359.15625 | 31.25 |
| 44359.166666666664 | 31.23 |
| 44359.177083333336 | 31.23 |
| 44359.1875 | 31.22 |
| 44359.197916666664 | 31.2 |
| 44359.208333333336 | 31.07 |
| 44359.21875 | 30.97 |
| 44359.229166666664 | 30.93 |
| 44359.239583333336 | 30.88 |
| 44359.25 | 30.91 |
| 44359.260416666664 | 30.72 |
| 44359.270833333336 | 30.67 |
| 44359.28125 | 30.57 |
| 44359.291666666664 | 30.37 |
| 44359.302083333336 | 30.41 |
| 44359.3125 | 30.4 |
| 44359.322916666664 | 30.39 |
| 44359.333333333336 | 30.25 |
| 44359.34375 | 30.09 |
| 44359.354166666664 | 29.98 |
| 44359.364583333336 | 29.92 |
| 44359.375 | 29.86 |
| 44359.385416666664 | 29.83 |
| 44359.395833333336 | 29.81 |
| 44359.40625 | 29.92 |
| 44359.416666666664 | 29.93 |
| 44359.427083333336 | 29.94 |
| 44359.4375 | 30.11 |
| 44359.447916666664 | 30.24 |
| 44359.458333333336 | 30.35 |
| 44359.46875 | 30.57 |
| 44359.479166666664 | 30.73 |
| 44359.489583333336 | 30.88 |
| 44359.5 | 30.95 |
| 44359.510416666664 | 30.97 |
| 44359.520833333336 | 30.98 |
| 44359.53125 | 30.99 |
| 44359.541666666664 | 31.02 |
| 44359.552083333336 | 31.06 |
| 44359.5625 | 31.1 |
| 44359.572916666664 | 31.11 |
| 44359.583333333336 | 31.1 |
| 44359.59375 | 31 |
| 44359.604166666664 | 31.02 |
| 44359.614583333336 | 31.04 |
| 44359.625 | 31.07 |
| 44359.635416666664 | 31.06 |
| 44359.645833333336 | 31.06 |
| 44359.65625 | 31.02 |
| 44359.666666666664 | 30.98 |
| 44359.677083333336 | 30.89 |
| 44359.6875 | 30.81 |
| 44359.697916666664 | 30.66 |
| 44359.708333333336 | 30.61 |
| 44359.71875 | 30.61 |
| 44359.729166666664 | 30.64 |
| 44359.739583333336 | 30.52 |
| 44359.75 | 30.4 |
| 44359.760416666664 | 30.28 |
| 44359.770833333336 | 30.2 |
| 44359.78125 | 29.98 |
| 44359.791666666664 | 29.89 |
| 44359.802083333336 | 29.94 |
| 44359.8125 | 30 |
| 44359.822916666664 | 29.96 |
| 44359.833333333336 | 29.91 |
| 44359.84375 | 29.75 |
| 44359.854166666664 | 29.71 |
| 44359.864583333336 | 29.51 |
| 44359.875 | 29.4 |
| 44359.885416666664 | 29.32 |
| 44359.895833333336 | 29.26 |
| 44359.90625 | 29.31 |
| 44359.916666666664 | 29.45 |
| 44359.927083333336 | 29.46 |
| 44359.9375 | 29.52 |
| 44359.947916666664 | 29.73 |
| 44359.958333333336 | 29.85 |
| 44359.96875 | 30.08 |
| 44359.979166666664 | 30.33 |
| 44359.989583333336 | 30.5 |
| 44360.0 | 30.64 |
| 44360.010416666664 | 30.74 |
| 44360.020833333336 | 30.83 |
| 44360.03125 | 30.89 |
| 44360.041666666664 | 30.93 |
| 44360.052083333336 | 30.95 |
| 44360.0625 | 30.98 |
| 44360.072916666664 | 31.01 |
| 44360.083333333336 | 31.05 |
| 44360.09375 | 31.09 |
| 44360.104166666664 | 31.14 |
| 44360.114583333336 | 31.2 |
| 44360.125 | 31.28 |
| 44360.135416666664 | 31.31 |
| 44360.145833333336 | 31.23 |
| 44360.15625 | 31.23 |
| 44360.166666666664 | 31.16 |
| 44360.177083333336 | 31.02 |
| 44360.1875 | 31 |
| 44360.197916666664 | 31.03 |
| 44360.208333333336 | 30.98 |
| 44360.21875 | 30.87 |
| 44360.229166666664 | 30.82 |
| 44360.239583333336 | 30.8 |
| 44360.25 | 30.68 |
| 44360.260416666664 | 30.5 |
| 44360.270833333336 | 30.48 |
| 44360.28125 | 30.38 |
| 44360.291666666664 | 30.33 |
| 44360.302083333336 | 30.32 |
| 44360.3125 | 30.24 |
| 44360.322916666664 | 30.2 |
| 44360.333333333336 | 30.09 |
| 44360.34375 | 30.02 |
| 44360.354166666664 | 29.91 |
| 44360.364583333336 | 29.82 |
| 44360.375 | 29.75 |
| 44360.385416666664 | 29.67 |
| 44360.395833333336 | 29.6 |
| 44360.40625 | 29.55 |
| 44360.416666666664 | 29.55 |
| 44360.427083333336 | 29.63 |
| 44360.4375 | 29.68 |
| 44360.447916666664 | 29.7 |
| 44360.458333333336 | 29.73 |
| 44360.46875 | 29.81 |
| 44360.479166666664 | 28.96 |
| 44360.489583333336 | 30.15 |
| 44360.5 | 30.48 |
| 44360.510416666664 | 30.72 |
| 44360.520833333336 | 30.83 |
| 44360.53125 | 30.86 |
| 44360.541666666664 | 30.87 |
| 44360.552083333336 | 30.88 |
| 44360.5625 | 30.91 |
| 44360.572916666664 | 30.95 |
| 44360.583333333336 | 30.99 |
| 44360.59375 | 30.99 |
| 44360.604166666664 | 30.99 |
| 44360.614583333336 | 31.04 |
| 44360.625 | 31.1 |
| 44360.635416666664 | 31.09 |
| 44360.645833333336 | 31.02 |
| 44360.65625 | 31.06 |
| 44360.666666666664 | 30.98 |
| 44360.677083333336 | 30.93 |
| 44360.6875 | 30.91 |
| 44360.697916666664 | 30.92 |
| 44360.708333333336 | 30.92 |
| 44360.71875 | 30.91 |
| 44360.729166666664 | 30.88 |
| 44360.739583333336 | 30.82 |
| 44360.75 | 30.71 |
| 44360.760416666664 | 30.56 |
| 44360.770833333336 | 30.71 |
| 44360.78125 | 30.35 |
| 44360.791666666664 | 30.22 |
| 44360.802083333336 | 30.2 |
| 44360.8125 | 29.67 |
| 44360.822916666664 | 29.45 |
| 44360.833333333336 | 29.81 |
| 44360.84375 | 29.82 |
| 44360.854166666664 | 29.64 |
| 44360.864583333336 | 29.55 |
| 44360.875 | 29.53 |
| 44360.885416666664 | 29.53 |
| 44360.895833333336 | 29.47 |
| 44360.90625 | 29.46 |
| 44360.916666666664 | 29.52 |
| 44360.927083333336 | 29.59 |
| 44360.9375 | 29.58 |
| 44360.947916666664 | 29.61 |
| 44360.958333333336 | 29.72 |
| 44360.96875 | 29.88 |
| 44360.979166666664 | 30.22 |
| 44360.989583333336 | 30.5 |
| 44361.0 | 30.63 |
| 44361.010416666664 | 30.73 |
| 44361.020833333336 | 30.84 |
| 44361.03125 | 30.9 |
| 44361.041666666664 | 30.96 |
| 44361.052083333336 | 30.99 |
| 44361.0625 | 31.03 |
| 44361.072916666664 | 31.06 |
| 44361.083333333336 | 31.09 |
| 44361.09375 | 31.13 |
| 44361.104166666664 | 31.19 |
| 44361.114583333336 | 31.23 |
| 44361.125 | 31.27 |
| 44361.135416666664 | 31.3 |
| 44361.145833333336 | 31.32 |
| 44361.15625 | 31.32 |
| 44361.166666666664 | 31.33 |
| 44361.177083333336 | 31.26 |
| 44361.1875 | 31.25 |
| 44361.197916666664 | 31.24 |
| 44361.208333333336 | 31.13 |
| 44361.21875 | 31.18 |
| 44361.229166666664 | 31.09 |
| 44361.239583333336 | 31.18 |
| 44361.25 | 31.05 |
| 44361.260416666664 | 30.99 |
| 44361.270833333336 | 30.97 |
| 44361.28125 | 30.93 |
| 44361.291666666664 | 30.92 |
| 44361.302083333336 | 30.85 |
| 44361.3125 | 30.7 |
| 44361.322916666664 | 30.65 |
| 44361.333333333336 | 30.55 |
| 44361.34375 | 30.43 |
| 44361.354166666664 | 30.33 |
| 44361.364583333336 | 30.23 |
| 44361.375 | 30.1 |
| 44361.385416666664 | 29.99 |
| 44361.395833333336 | 29.92 |
| 44361.40625 | 29.85 |
| 44361.416666666664 | 29.78 |
| 44361.427083333336 | 29.73 |
| 44361.4375 | 29.7 |
| 44361.447916666664 | 29.69 |
| 44361.458333333336 | 29.7 |
| 44361.46875 | 29.79 |
| 44361.479166666664 | 29.82 |
| 44361.489583333336 | 29.85 |
| 44361.5 | 29.95 |
| 44361.510416666664 | 30.1 |
| 44361.520833333336 | 30.34 |
| 44361.53125 | 30.63 |
| 44361.541666666664 | 30.77 |
| 44361.552083333336 | 30.87 |
| 44361.5625 | 30.92 |
| 44361.572916666664 | 30.93 |
| 44361.583333333336 | 30.99 |
| 44361.59375 | 31.02 |
| 44361.604166666664 | 31.06 |
| 44361.614583333336 | 31.09 |
| 44361.625 | 31.11 |
| 44361.635416666664 | 31.14 |
| 44361.645833333336 | 31.15 |
| 44361.65625 | 31.17 |
| 44361.666666666664 | 31.18 |
| 44361.677083333336 | 31.2 |
| 44361.6875 | 31.12 |
| 44361.697916666664 | 30.93 |
| 44361.708333333336 | 31.04 |
| 44361.71875 | 31.04 |
| 44361.729166666664 | 30.96 |
| 44361.739583333336 | 31.01 |
| 44361.75 | 30.92 |
| 44361.760416666664 | 30.9 |
| 44361.770833333336 | 30.91 |
| 44361.78125 | 30.9 |
| 44361.791666666664 | 30.9 |
| 44361.802083333336 | 30.92 |
| 44361.8125 | 30.82 |
| 44361.822916666664 | 30.72 |
| 44361.833333333336 | 30.59 |
| 44361.84375 | 30.44 |
| 44361.854166666664 | 30.36 |
| 44361.864583333336 | 30.26 |
| 44361.875 | 30.15 |
| 44361.885416666664 | 30.12 |
| 44361.895833333336 | 30.06 |
| 44361.90625 | 30.02 |
| 44361.916666666664 | 29.99 |
| 44361.927083333336 | 29.99 |
| 44361.9375 | 30.09 |
| 44361.947916666664 | 30.08 |
| 44361.958333333336 | 30.08 |
| 44361.96875 | 30.18 |
| 44361.979166666664 | 30.37 |
| 44361.989583333336 | 30.52 |
| 44362.0 | 30.16 |
| 44362.010416666664 | 30.95 |
| 44362.020833333336 | 31.01 |
| 44362.03125 | 31.06 |
| 44362.041666666664 | 31.1 |
| 44362.052083333336 | 31.12 |
| 44362.0625 | 31.14 |
| 44362.072916666664 | 31.17 |
| 44362.083333333336 | 31.2 |
| 44362.09375 | 31.22 |
| 44362.104166666664 | 31.23 |
| 44362.114583333336 | 31.25 |
| 44362.125 | 31.28 |
| 44362.135416666664 | 31.31 |
| 44362.145833333336 | 31.36 |
| 44362.15625 | 31.4 |
| 44362.166666666664 | 31.43 |
| 44362.177083333336 | 31.45 |
| 44362.1875 | 31.46 |
| 44362.197916666664 | 31.44 |
| 44362.208333333336 | 31.43 |
| 44362.21875 | 31.38 |
| 44362.229166666664 | 31.38 |
| 44362.239583333336 | 31.36 |
| 44362.25 | 31.39 |
| 44362.260416666664 | 31.37 |
| 44362.270833333336 | 31.32 |
| 44362.28125 | 31.29 |
| 44362.291666666664 | 31.25 |
| 44362.302083333336 | 31.23 |
| 44362.3125 | 31.23 |
| 44362.322916666664 | 31.2 |
| 44362.333333333336 | 31.16 |
| 44362.34375 | 31.14 |
| 44362.354166666664 | 30.91 |
| 44362.364583333336 | 30.75 |
| 44362.375 | 30.59 |
| 44362.385416666664 | 30.39 |
| 44362.395833333336 | 30.27 |
| 44362.40625 | 30.17 |
| 44362.416666666664 | 30.03 |
| 44362.427083333336 | 29.46 |
| 44362.4375 | 29.27 |
| 44362.447916666664 | 28.97 |
| 44362.458333333336 | 28.94 |
| 44362.46875 | 29.08 |
| 44362.479166666664 | 29.29 |
| 44362.489583333336 | 29.39 |
| 44362.5 | 29.47 |
| 44362.510416666664 | 29.65 |
| 44362.520833333336 | 29.8 |
| 44362.53125 | 30 |
| 44362.541666666664 | 30.29 |
| 44362.552083333336 | 30.53 |
| 44362.5625 | 30.67 |
| 44362.572916666664 | 30.76 |
| 44362.583333333336 | 30.87 |
| 44362.59375 | 30.98 |
| 44362.604166666664 | 31.06 |
| 44362.614583333336 | 31.14 |
| 44362.625 | 31.17 |
| 44362.635416666664 | 31.2 |
| 44362.645833333336 | 31.23 |
| 44362.65625 | 31.25 |
| 44362.666666666664 | 31.27 |
| 44362.677083333336 | 31.28 |
| 44362.6875 | 31.3 |
| 44362.697916666664 | 31.3 |
| 44362.708333333336 | 31.31 |
| 44362.71875 | 31.33 |
| 44362.729166666664 | 31.35 |
| 44362.739583333336 | 31.3 |
| 44362.75 | 31.34 |
| 44362.760416666664 | 31.33 |
| 44362.770833333336 | 31.22 |
| 44362.78125 | 31.21 |
| 44362.791666666664 | 31.1 |
| 44362.802083333336 | 30.98 |
| 44362.8125 | 30.86 |
| 44362.822916666664 | 30.75 |
| 44362.833333333336 | 30.86 |
| 44362.84375 | 30.69 |
| 44362.854166666664 | 30.52 |
| 44362.864583333336 | 30.46 |
| 44362.875 | 30.27 |
| 44362.885416666664 | 30.15 |
| 44362.895833333336 | 30 |
| 44362.90625 | 29.92 |
| 44362.916666666664 | 29.81 |
| 44362.927083333336 | 29.64 |
| 44362.9375 | 29.6 |
| 44362.947916666664 | 29.53 |
| 44362.958333333336 | 29.53 |
| 44362.96875 | 29.52 |
| 44362.979166666664 | 29.62 |
| 44362.989583333336 | 29.67 |
| 44363.0 | 29.72 |
| 44363.010416666664 | 29.83 |
| 44363.020833333336 | 30 |
| 44363.03125 | 30.44 |
| 44363.041666666664 | 30.6 |
| 44363.052083333336 | 30.73 |
| 44363.0625 | 30.83 |
| 44363.072916666664 | 30.91 |
| 44363.083333333336 | 30.98 |
| 44363.09375 | 31.07 |
| 44363.104166666664 | 31.14 |
| 44363.114583333336 | 31.18 |
| 44363.125 | 31.2 |
| 44363.135416666664 | 31.22 |
| 44363.145833333336 | 31.27 |
| 44363.15625 | 31.37 |
| 44363.166666666664 | 31.45 |
| 44363.177083333336 | 31.5 |
| 44363.1875 | 31.54 |
| 44363.197916666664 | 31.55 |
| 44363.208333333336 | 31.56 |
| 44363.21875 | 31.56 |
| 44363.229166666664 | 31.56 |
| 44363.239583333336 | 31.52 |
| 44363.25 | 31.51 |
| 44363.260416666664 | 31.51 |
| 44363.270833333336 | 31.46 |
| 44363.28125 | 31.43 |
| 44363.291666666664 | 31.42 |
| 44363.302083333336 | 31.4 |
| 44363.3125 | 31.34 |
| 44363.322916666664 | 31.29 |
| 44363.333333333336 | 31.23 |
| 44363.34375 | 31.14 |
| 44363.354166666664 | 31.06 |
| 44363.364583333336 | 31.03 |
| 44363.375 | 30.84 |
| 44363.385416666664 | 30.73 |
| 44363.395833333336 | 30.59 |
| 44363.40625 | 30.45 |
| 44363.416666666664 | 30.3 |
| 44363.427083333336 | 30.15 |
| 44363.4375 | 30.06 |
| 44363.447916666664 | 29.97 |
| 44363.458333333336 | 29.93 |
| 44363.46875 | 29.78 |
| 44363.479166666664 | 29.86 |
| 44363.489583333336 | 29.84 |
| 44363.5 | 29.85 |
| 44363.510416666664 | 29.9 |
| 44363.520833333336 | 29.94 |
| 44363.53125 | 29.96 |
| 44363.541666666664 | 30 |
| 44363.552083333336 | 30.1 |
| 44363.5625 | 30.31 |
| 44363.572916666664 | 30.63 |
| 44363.583333333336 | 30.9 |
| 44363.59375 | 31.01 |
| 44363.604166666664 | 31.05 |
| 44363.614583333336 | 31.08 |
| 44363.625 | 31.11 |
| 44363.635416666664 | 31.16 |
| 44363.645833333336 | 31.2 |
| 44363.65625 | 31.28 |
| 44363.666666666664 | 31.3 |
| 44363.677083333336 | 31.33 |
| 44363.6875 | 31.35 |
| 44363.697916666664 | 31.39 |
| 44363.708333333336 | 31.41 |
| 44363.71875 | 31.42 |
| 44363.729166666664 | 31.44 |
| 44363.739583333336 | 31.46 |
| 44363.75 | 31.49 |
| 44363.760416666664 | 31.34 |
| 44363.770833333336 | 31.45 |
| 44363.78125 | 31.4 |
| 44363.791666666664 | 31.43 |
| 44363.802083333336 | 31.42 |
| 44363.8125 | 31.35 |
| 44363.822916666664 | 31.29 |
| 44363.833333333336 | 31.28 |
| 44363.84375 | 31.26 |
| 44363.854166666664 | 31.28 |
| 44363.864583333336 | 31.22 |
| 44363.875 | 31.23 |
| 44363.885416666664 | 31.23 |
| 44363.895833333336 | 31.13 |
| 44363.90625 | 30.97 |
| 44363.916666666664 | 30.84 |
| 44363.927083333336 | 30.82 |
| 44363.9375 | 30.64 |
| 44363.947916666664 | 30.59 |
| 44363.958333333336 | 30.37 |
| 44363.96875 | 30.27 |
| 44363.979166666664 | 30.19 |
| 44363.989583333336 | 30.14 |
| 44364.0 | 30.09 |
| 44364.010416666664 | 30.13 |
| 44364.020833333336 | 30.25 |
| 44364.03125 | 30.27 |
| 44364.041666666664 | 30.28 |
| 44364.052083333336 | 30.38 |
| 44364.0625 | 30.53 |
| 44364.072916666664 | 30.77 |
| 44364.083333333336 | 31 |
| 44364.09375 | 31.15 |
| 44364.104166666664 | 31.21 |
| 44364.114583333336 | 31.23 |
| 44364.125 | 31.27 |
| 44364.135416666664 | 31.32 |
| 44364.145833333336 | 31.36 |
| 44364.15625 | 31.4 |
| 44364.166666666664 | 31.43 |
| 44364.177083333336 | 31.47 |
| 44364.1875 | 31.49 |
| 44364.197916666664 | 31.51 |
| 44364.208333333336 | 31.54 |
| 44364.21875 | 31.58 |
| 44364.229166666664 | 31.61 |
| 44364.239583333336 | 31.64 |
| 44364.25 | 31.63 |
| 44364.260416666664 | 31.66 |
| 44364.270833333336 | 31.63 |
| 44364.28125 | 31.63 |
| 44364.291666666664 | 31.61 |
| 44364.302083333336 | 31.59 |
| 44364.3125 | 31.52 |
| 44364.322916666664 | 31.53 |
| 44364.333333333336 | 31.45 |
| 44364.34375 | 31.48 |
| 44364.354166666664 | 31.43 |
| 44364.364583333336 | 31.46 |
| 44364.375 | 31.38 |
| 44364.385416666664 | 31.4 |
| 44364.395833333336 | 31.18 |
| 44364.40625 | 31.06 |
| 44364.416666666664 | 30.9 |
| 44364.427083333336 | 30.84 |
| 44364.4375 | 30.71 |
| 44364.447916666664 | 30.58 |
| 44364.458333333336 | 30.38 |
| 44364.46875 | 30.23 |
| 44364.479166666664 | 30.13 |
| 44364.489583333336 | 30.07 |
| 44364.5 | 30.03 |
| 44364.510416666664 | 30.02 |
| 44364.520833333336 | 29.99 |
| 44364.53125 | 30 |
| 44364.541666666664 | 30.07 |
| 44364.552083333336 | 30.1 |
| 44364.5625 | 30.12 |
| 44364.572916666664 | 30.24 |
| 44364.583333333336 | 30.35 |
| 44364.59375 | 30.62 |
| 44364.604166666664 | 30.87 |
| 44364.614583333336 | 31.03 |
| 44364.625 | 31.15 |
| 44364.635416666664 | 31.12 |
| 44364.645833333336 | 31.27 |
| 44364.65625 | 31.3 |
| 44364.666666666664 | 31.37 |
| 44364.677083333336 | 31.43 |
| 44364.6875 | 31.49 |
| 44364.697916666664 | 31.54 |
| 44364.708333333336 | 31.58 |
| 44364.71875 | 31.61 |
| 44364.729166666664 | 31.63 |
| 44364.739583333336 | 31.67 |
| 44364.75 | 31.71 |
| 44364.760416666664 | 31.72 |
| 44364.770833333336 | 30.23 |
| 44364.78125 | 30.24 |
| 44364.791666666664 | 30.2 |
| 44364.802083333336 | 30.21 |
| 44364.8125 | 30.26 |
| 44364.822916666664 | 30.32 |
| 44364.833333333336 | 30.34 |
| 44364.84375 | 30.34 |
| 44364.854166666664 | 30.19 |
| 44364.864583333336 | 30.04 |
| 44364.875 | 29.87 |
| 44364.885416666664 | 29.78 |
| 44364.895833333336 | 29.77 |
| 44364.90625 | 29.68 |
| 44364.916666666664 | 29.6 |
| 44364.927083333336 | 29.53 |
| 44364.9375 | 29.52 |
| 44364.947916666664 | 29.32 |
| 44364.958333333336 | 29.21 |
| 44364.96875 | 29.04 |
| 44364.979166666664 | 28.85 |
| 44364.989583333336 | 28.73 |
| 44365.0 | 28.57 |
| 44365.010416666664 | 28.43 |
| 44365.020833333336 | 28.5 |
| 44365.03125 | 28.57 |
| 44365.041666666664 | 28.61 |
| 44365.052083333336 | 28.79 |
| 44365.0625 | 29.05 |
| 44365.072916666664 | 29.23 |
| 44365.083333333336 | 29.31 |
| 44365.09375 | 29.46 |
| 44365.104166666664 | 29.67 |
| 44365.114583333336 | 29.93 |
| 44365.125 | 30.15 |
| 44365.135416666664 | 30.27 |
| 44365.145833333336 | 30.29 |
| 44365.15625 | 30.36 |
| 44365.166666666664 | 30.36 |
| 44365.177083333336 | 30.42 |
| 44365.1875 | 30.46 |
| 44365.197916666664 | 30.51 |
| 44365.208333333336 | 30.63 |
| 44365.21875 | 30.62 |
| 44365.229166666664 | 30.65 |
| 44365.239583333336 | 30.71 |
| 44365.25 | 30.74 |
| 44365.260416666664 | 30.75 |
| 44365.270833333336 | 30.75 |
| 44365.28125 | 30.74 |
| 44365.291666666664 | 30.75 |
| 44365.302083333336 | 30.69 |
| 44365.3125 | 30.65 |
| 44365.322916666664 | 30.62 |
| 44365.333333333336 | 30.55 |
| 44365.34375 | 30.48 |
| 44365.354166666664 | 30.39 |
| 44365.364583333336 | 30.32 |
| 44365.375 | 30.24 |
| 44365.385416666664 | 30.16 |
| 44365.395833333336 | 30.09 |
| 44365.40625 | 30.06 |
| 44365.416666666664 | 29.99 |
| 44365.427083333336 | 29.88 |
| 44365.4375 | 29.89 |
| 44365.447916666664 | 29.76 |
| 44365.458333333336 | 29.7 |
| 44365.46875 | 29.69 |
| 44365.479166666664 | 29.71 |
| 44365.489583333336 | 29.72 |
| 44365.5 | 29.77 |
| 44365.510416666664 | 29.88 |
| 44365.520833333336 | 30.02 |
| 44365.53125 | 30.1 |
| 44365.541666666664 | 30.25 |
| 44365.552083333336 | 30.35 |
| 44365.5625 | 30.46 |
| 44365.572916666664 | 30.61 |
| 44365.583333333336 | 30.69 |
| 44365.59375 | 30.74 |
| 44365.604166666664 | 30.86 |
| 44365.614583333336 | 30.99 |
| 44365.625 | 31.13 |
| 44365.635416666664 | 31.33 |
| 44365.645833333336 | 31.46 |
| 44365.65625 | 31.54 |
| 44365.666666666664 | 31.54 |
| 44365.677083333336 | 31.56 |
| 44365.6875 | 31.6 |
| 44365.697916666664 | 31.64 |
| 44365.708333333336 | 31.7 |
| 44365.71875 | 31.76 |
| 44365.729166666664 | 31.8 |
| 44365.739583333336 | 31.83 |
| 44365.75 | 31.83 |
| 44365.760416666664 | 31.85 |
| 44365.770833333336 | 31.86 |
| 44365.78125 | 31.88 |
| 44365.791666666664 | 31.88 |
| 44365.802083333336 | 31.85 |
| 44365.8125 | 31.81 |
| 44365.822916666664 | 31.76 |
| 44365.833333333336 | 31.73 |
| 44365.84375 | 31.51 |
| 44365.854166666664 | 31.44 |
| 44365.864583333336 | 31.44 |
| 44365.875 | 31.41 |
| 44365.885416666664 | 31.32 |
| 44365.895833333336 | 31.29 |
| 44365.90625 | 31.12 |
| 44365.916666666664 | 31.06 |
| 44365.927083333336 | 31.06 |
| 44365.9375 | 31.03 |
| 44365.947916666664 | 31.02 |
| 44365.958333333336 | 31.01 |
| 44365.96875 | 30.92 |
| 44365.979166666664 | 30.74 |
| 44365.989583333336 | 30.59 |
| 44366.0 | 30.48 |
| 44366.010416666664 | 30.43 |
| 44366.020833333336 | 30.4 |
| 44366.03125 | 30.37 |
| 44366.041666666664 | 30.33 |
| 44366.052083333336 | 30.29 |
| 44366.0625 | 30.29 |
| 44366.072916666664 | 30.31 |
| 44366.083333333336 | 30.34 |
| 44366.09375 | 30.38 |
| 44366.104166666664 | 30.41 |
| 44366.114583333336 | 30.42 |
| 44366.125 | 30.46 |
| 44366.135416666664 | 30.57 |
| 44366.145833333336 | 30.7 |
| 44366.15625 | 30.87 |
| 44366.166666666664 | 31.02 |
| 44366.177083333336 | 31.11 |
| 44366.1875 | 31.19 |
| 44366.197916666664 | 31.23 |
| 44366.208333333336 | 31.29 |
| 44366.21875 | 31.32 |
| 44366.229166666664 | 31.36 |
| 44366.239583333336 | 31.39 |
| 44366.25 | 31.4 |
| 44366.260416666664 | 31.42 |
| 44366.270833333336 | 31.43 |
| 44366.28125 | 31.44 |
| 44366.291666666664 | 31.45 |
| 44366.302083333336 | 31.46 |
| 44366.3125 | 31.47 |
| 44366.322916666664 | 31.48 |
| 44366.333333333336 | 31.5 |
| 44366.34375 | 31.5 |
| 44366.354166666664 | 31.43 |
| 44366.364583333336 | 31.44 |
| 44366.375 | 31.48 |
| 44366.385416666664 | 31.58 |
| 44366.395833333336 | 31.58 |
| 44366.40625 | 31.6 |
| 44366.416666666664 | 31.56 |
| 44366.427083333336 | 31.61 |
| 44366.4375 | 31.58 |
| 44366.447916666664 | 31.55 |
| 44366.458333333336 | 31.42 |
| 44366.46875 | 31.28 |
| 44366.479166666664 | 31.19 |
| 44366.489583333336 | 31.08 |
| 44366.5 | 30.98 |
| 44366.510416666664 | 30.83 |
| 44366.520833333336 | 30.76 |
| 44366.53125 | 30.65 |
| 44366.541666666664 | 30.6 |
| 44366.552083333336 | 30.58 |
| 44366.5625 | 30.53 |
| 44366.572916666664 | 30.51 |
| 44366.583333333336 | 30.51 |
| 44366.59375 | 30.51 |
| 44366.604166666664 | 30.58 |
| 44366.614583333336 | 30.58 |
| 44366.625 | 30.57 |
| 44366.635416666664 | 30.63 |
| 44366.645833333336 | 30.69 |
| 44366.65625 | 30.85 |
| 44366.666666666664 | 31.12 |
| 44366.677083333336 | 31.33 |
| 44366.6875 | 31.42 |
| 44366.697916666664 | 31.47 |
| 44366.708333333336 | 31.58 |
| 44366.71875 | 31.71 |
| 44366.729166666664 | 31.75 |
| 44366.739583333336 | 31.81 |
| 44366.75 | 31.92 |
| 44366.760416666664 | 31.88 |
| 44366.770833333336 | 31.92 |
| 44366.78125 | 31.95 |
| 44366.791666666664 | 31.99 |
| 44366.802083333336 | 32.02 |
| 44366.8125 | 32.01 |
| 44366.822916666664 | 32.03 |
| 44366.833333333336 | 32.03 |
| 44366.84375 | 32.04 |
| 44366.854166666664 | 32.04 |
| 44366.864583333336 | 32.04 |
| 44366.875 | 32.04 |
| 44366.885416666664 | 31.87 |
| 44366.895833333336 | 32 |
| 44366.90625 | 32.15 |
| 44366.916666666664 | 32.1 |
| 44366.927083333336 | 32.11 |
| 44366.9375 | 32.13 |
| 44366.947916666664 | 32.09 |
| 44366.958333333336 | 32.09 |
| 44366.96875 | 32.06 |
| 44366.979166666664 | 32.09 |
| 44366.989583333336 | 32.1 |
| 44367.0 | 32.02 |
| 44367.010416666664 | 32.02 |
| 44367.020833333336 | 31.89 |
| 44367.03125 | 31.66 |
| 44367.041666666664 | 31.53 |
| 44367.052083333336 | 31.41 |
| 44367.0625 | 31.36 |
| 44367.072916666664 | 31.31 |
| 44367.083333333336 | 31.13 |
| 44367.09375 | 31.05 |
| 44367.104166666664 | 31 |
| 44367.114583333336 | 31.01 |
| 44367.125 | 30.96 |
| 44367.135416666664 | 31.08 |
| 44367.145833333336 | 31.11 |
| 44367.15625 | 31.12 |
| 44367.166666666664 | 31.17 |
| 44367.177083333336 | 31.27 |
| 44367.1875 | 31.38 |
| 44367.197916666664 | 31.54 |
| 44367.208333333336 | 31.66 |
| 44367.21875 | 31.72 |
| 44367.229166666664 | 31.78 |
| 44367.239583333336 | 31.83 |
| 44367.25 | 31.92 |
| 44367.260416666664 | 31.96 |
| 44367.270833333336 | 32 |
| 44367.28125 | 32.05 |
| 44367.291666666664 | 32.08 |
| 44367.302083333336 | 32.1 |
| 44367.3125 | 32.12 |
| 44367.322916666664 | 32.12 |
| 44367.333333333336 | 32.1 |
| 44367.34375 | 32.1 |
| 44367.354166666664 | 32.12 |
| 44367.364583333336 | 32.09 |
| 44367.375 | 32.1 |
| 44367.385416666664 | 32.07 |
| 44367.395833333336 | 32.06 |
| 44367.40625 | 32.07 |
| 44367.416666666664 | 32.08 |
| 44367.427083333336 | 32.11 |
| 44367.4375 | 32.09 |
| 44367.447916666664 | 32.08 |
| 44367.458333333336 | 32.08 |
| 44367.46875 | 32.04 |
| 44367.479166666664 | 32.03 |
| 44367.489583333336 | 32.05 |
| 44367.5 | 31.98 |
| 44367.510416666664 | 31.93 |
| 44367.520833333336 | 31.86 |
| 44367.53125 | 31.75 |
| 44367.541666666664 | 31.59 |
| 44367.552083333336 | 31.46 |
| 44367.5625 | 31.42 |
| 44367.572916666664 | 31.27 |
| 44367.583333333336 | 31.24 |
| 44367.59375 | 31.15 |
| 44367.604166666664 | 31.14 |
| 44367.614583333336 | 31.12 |
| 44367.625 | 31.03 |
| 44367.635416666664 | 31.16 |
| 44367.645833333336 | 31.19 |
| 44367.65625 | 31.17 |
| 44367.666666666664 | 31.21 |
| 44367.677083333336 | 31.27 |
| 44367.6875 | 31.36 |
| 44367.697916666664 | 31.62 |
| 44367.708333333336 | 31.78 |
| 44367.71875 | 31.84 |
| 44367.729166666664 | 31.87 |
| 44367.739583333336 | 31.99 |
| 44367.75 | 32.09 |
| 44367.760416666664 | 32.14 |
| 44367.770833333336 | 32.2 |
| 44367.78125 | 32.23 |
| 44367.791666666664 | 32.24 |
| 44367.802083333336 | 32.27 |
| 44367.8125 | 32.29 |
| 44367.822916666664 | 32.31 |
| 44367.833333333336 | 32.3 |
| 44367.84375 | 32.32 |
| 44367.854166666664 | 32.33 |
| 44367.864583333336 | 32.36 |
| 44367.875 | 32.38 |
| 44367.885416666664 | 32.39 |
| 44367.895833333336 | 32.39 |
| 44367.90625 | 32.39 |
| 44367.916666666664 | 32.31 |
| 44367.927083333336 | 32.35 |
| 44367.9375 | 32.28 |
| 44367.947916666664 | 32.31 |
| 44367.958333333336 | 32.39 |
| 44367.96875 | 32.38 |
| 44367.979166666664 | 32.4 |
| 44367.989583333336 | 32.4 |
| 44368.0 | 32.4 |
| 44368.010416666664 | 32.43 |
| 44368.020833333336 | 32.44 |
| 44368.03125 | 32.42 |
| 44368.041666666664 | 32.42 |
| 44368.052083333336 | 32.3 |
| 44368.0625 | 32.15 |
| 44368.072916666664 | 32.1 |
| 44368.083333333336 | 32.01 |
| 44368.09375 | 31.95 |
| 44368.104166666664 | 31.83 |
| 44368.114583333336 | 31.68 |
| 44368.125 | 31.59 |
| 44368.135416666664 | 31.5 |
| 44368.145833333336 | 31.48 |
| 44368.15625 | 31.44 |
| 44368.166666666664 | 31.44 |
| 44368.177083333336 | 31.55 |
| 44368.1875 | 31.52 |
| 44368.197916666664 | 31.57 |
| 44368.208333333336 | 31.64 |
| 44368.21875 | 31.72 |
| 44368.229166666664 | 31.83 |
| 44368.239583333336 | 32.05 |
| 44368.25 | 32.04 |
| 44368.260416666664 | 32.11 |
| 44368.270833333336 | 32.14 |
| 44368.28125 | 32.24 |
| 44368.291666666664 | 32.31 |
| 44368.302083333336 | 32.46 |
| 44368.3125 | 32.46 |
| 44368.322916666664 | 32.51 |
| 44368.333333333336 | 32.53 |
| 44368.34375 | 32.53 |
| 44368.354166666664 | 32.52 |
| 44368.364583333336 | 32.51 |
| 44368.375 | 32.51 |
| 44368.385416666664 | 32.51 |
| 44368.395833333336 | 32.5 |
| 44368.40625 | 32.51 |
| 44368.416666666664 | 32.51 |
| 44368.427083333336 | 32.49 |
| 44368.4375 | 32.44 |
| 44368.447916666664 | 32.48 |
| 44368.458333333336 | 32.55 |
| 44368.46875 | 32.57 |
| 44368.479166666664 | 32.6 |
| 44368.489583333336 | 32.59 |
| 44368.5 | 32.56 |
| 44368.510416666664 | 32.54 |
| 44368.520833333336 | 32.51 |
| 44368.53125 | 32.49 |
| 44368.541666666664 | 32.48 |
| 44368.552083333336 | 32.42 |
| 44368.5625 | 32.32 |
| 44368.572916666664 | 32.11 |
| 44368.583333333336 | 31.96 |
| 44368.59375 | 31.87 |
| 44368.604166666664 | 31.78 |
| 44368.614583333336 | 31.74 |
| 44368.625 | 31.71 |
| 44368.635416666664 | 31.58 |
| 44368.645833333336 | 31.7 |
| 44368.65625 | 31.59 |
| 44368.666666666664 | 31.59 |
| 44368.677083333336 | 31.63 |
| 44368.6875 | 31.57 |
| 44368.697916666664 | 31.6 |
| 44368.708333333336 | 31.62 |
| 44368.71875 | 31.72 |
| 44368.729166666664 | 31.88 |
| 44368.739583333336 | 32.07 |
| 44368.75 | 32.14 |
| 44368.760416666664 | 32.24 |
| 44368.770833333336 | 32.37 |
| 44368.78125 | 32.42 |
| 44368.791666666664 | 32.45 |
| 44368.802083333336 | 32.46 |
| 44368.8125 | 32.5 |
| 44368.822916666664 | 32.54 |
| 44368.833333333336 | 32.54 |
| 44368.84375 | 32.53 |
| 44368.854166666664 | 32.51 |
| 44368.864583333336 | 32.51 |
| 44368.875 | 32.49 |
| 44368.885416666664 | 32.5 |
| 44368.895833333336 | 32.53 |
| 44368.90625 | 32.54 |
| 44368.916666666664 | 32.56 |
| 44368.927083333336 | 32.59 |
| 44368.9375 | 32.61 |
| 44368.947916666664 | 32.6 |
| 44368.958333333336 | 32.61 |
| 44368.96875 | 32.54 |
| 44368.979166666664 | 32.54 |
| 44368.989583333336 | 32.52 |
| 44369.0 | 32.52 |
| 44369.010416666664 | 32.57 |
| 44369.020833333336 | 32.57 |
| 44369.03125 | 32.62 |
| 44369.041666666664 | 32.6 |
| 44369.052083333336 | 32.63 |
| 44369.0625 | 32.6 |
| 44369.072916666664 | 32.64 |
| 44369.083333333336 | 32.68 |
| 44369.09375 | 32.67 |
| 44369.104166666664 | 32.63 |
| 44369.114583333336 | 32.58 |
| 44369.125 | 32.51 |
| 44369.135416666664 | 32.45 |
| 44369.145833333336 | 32.32 |
| 44369.15625 | 32.22 |
| 44369.166666666664 | 32.09 |
| 44369.177083333336 | 31.99 |
| 44369.1875 | 31.92 |
| 44369.197916666664 | 31.85 |
| 44369.208333333336 | 31.78 |
| 44369.21875 | 31.82 |
| 44369.229166666664 | 31.9 |
| 44369.239583333336 | 31.89 |
| 44369.25 | 31.9 |
| 44369.260416666664 | 31.94 |
| 44369.270833333336 | 32.05 |
| 44369.28125 | 32.16 |
| 44369.291666666664 | 32.27 |
| 44369.302083333336 | 32.34 |
| 44369.3125 | 32.37 |
| 44369.322916666664 | 32.41 |
| 44369.333333333336 | 32.44 |
| 44369.34375 | 32.47 |
| 44369.354166666664 | 32.51 |
| 44369.364583333336 | 32.55 |
| 44369.375 | 32.59 |
| 44369.385416666664 | 32.62 |
| 44369.395833333336 | 32.63 |
| 44369.40625 | 32.61 |
| 44369.416666666664 | 32.6 |
| 44369.427083333336 | 32.59 |
| 44369.4375 | 32.58 |
| 44369.447916666664 | 32.57 |
| 44369.458333333336 | 32.57 |
| 44369.46875 | 32.57 |
| 44369.479166666664 | 32.58 |
| 44369.489583333336 | 32.56 |
| 44369.5 | 32.54 |
| 44369.510416666664 | 32.55 |
| 44369.520833333336 | 32.57 |
| 44369.53125 | 32.56 |
| 44369.541666666664 | 32.54 |
| 44369.552083333336 | 32.52 |
| 44369.5625 | 32.51 |
| 44369.572916666664 | 32.53 |
| 44369.583333333336 | 32.51 |
| 44369.59375 | 32.48 |
| 44369.604166666664 | 32.45 |
| 44369.614583333336 | 32.35 |
| 44369.625 | 32.32 |
| 44369.635416666664 | 32.22 |
| 44369.645833333336 | 32.16 |
| 44369.65625 | 32.09 |
| 44369.666666666664 | 32.03 |
| 44369.677083333336 | 31.91 |
| 44369.6875 | 31.83 |
| 44369.697916666664 | 31.79 |
| 44369.708333333336 | 31.77 |
| 44369.71875 | 31.85 |
| 44369.729166666664 | 31.89 |
| 44369.739583333336 | 31.86 |
| 44369.75 | 31.72 |
| 44369.760416666664 | 31.8 |
| 44369.770833333336 | 31.88 |
| 44369.78125 | 31.93 |
| 44369.791666666664 | 31.89 |
| 44369.802083333336 | 31.93 |
| 44369.8125 | 31.86 |
| 44369.822916666664 | 31.75 |
| 44369.833333333336 | 31.66 |
| 44369.84375 | 31.6 |
| 44369.854166666664 | 31.56 |
| 44369.864583333336 | 31.61 |
| 44369.875 | 31.66 |
| 44369.885416666664 | 31.7 |
| 44369.895833333336 | 31.79 |
| 44369.90625 | 31.93 |
| 44369.916666666664 | 31.96 |
| 44369.927083333336 | 32.01 |
| 44369.9375 | 32.04 |
| 44369.947916666664 | 32.07 |
| 44369.958333333336 | 32.1 |
| 44369.96875 | 32.13 |
| 44369.979166666664 | 32.18 |
| 44369.989583333336 | 32.25 |
| 44370.0 | 32.28 |
| 44370.010416666664 | 32.33 |
| 44370.020833333336 | 32.3 |
| 44370.03125 | 32.21 |
| 44370.041666666664 | 32.18 |
| 44370.052083333336 | 32.1 |
| 44370.0625 | 32.08 |
| 44370.072916666664 | 32.02 |
| 44370.083333333336 | 31.94 |
| 44370.09375 | 31.87 |
| 44370.104166666664 | 31.67 |
| 44370.114583333336 | 31.56 |
| 44370.125 | 31.48 |
| 44370.135416666664 | 31.4 |
| 44370.145833333336 | 31.37 |
| 44370.15625 | 31.34 |
| 44370.166666666664 | 31.25 |
| 44370.177083333336 | 31.14 |
| 44370.1875 | 31.14 |
| 44370.197916666664 | 31.07 |
| 44370.208333333336 | 30.98 |
| 44370.21875 | 30.88 |
| 44370.229166666664 | 30.76 |
| 44370.239583333336 | 30.68 |
| 44370.25 | 30.59 |
| 44370.260416666664 | 30.49 |
| 44370.270833333336 | 30.69 |
| 44370.28125 | 30.61 |
| 44370.291666666664 | 30.75 |
| 44370.302083333336 | 30.88 |
| 44370.3125 | 31 |
| 44370.322916666664 | 31.11 |
| 44370.333333333336 | 31.22 |
| 44370.34375 | 31.34 |
| 44370.354166666664 | 31.35 |
| 44370.364583333336 | 31.4 |
| 44370.375 | 31.46 |
| 44370.385416666664 | 31.5 |
| 44370.395833333336 | 31.54 |
| 44370.40625 | 31.6 |
| 44370.416666666664 | 31.7 |
| 44370.427083333336 | 31.76 |
| 44370.4375 | 31.83 |
| 44370.447916666664 | 31.88 |
| 44370.458333333336 | 31.92 |
| 44370.46875 | 31.96 |
| 44370.479166666664 | 31.98 |
| 44370.489583333336 | 32.01 |
| 44370.5 | 32 |
| 44370.510416666664 | 32 |
| 44370.520833333336 | 31.89 |
| 44370.53125 | 31.94 |
| 44370.541666666664 | 32.03 |
| 44370.552083333336 | 31.99 |
| 44370.5625 | 31.92 |
| 44370.572916666664 | 31.84 |
| 44370.583333333336 | 31.82 |
| 44370.59375 | 31.72 |
| 44370.604166666664 | 31.68 |
| 44370.614583333336 | 31.61 |
| 44370.625 | 31.55 |
| 44370.635416666664 | 31.53 |
| 44370.645833333336 | 31.47 |
| 44370.65625 | 31.38 |
| 44370.666666666664 | 31.33 |
| 44370.677083333336 | 31.26 |
| 44370.6875 | 31.09 |
| 44370.697916666664 | 31.05 |
| 44370.708333333336 | 30.89 |
| 44370.71875 | 30.83 |
| 44370.729166666664 | 30.72 |
| 44370.739583333336 | 30.65 |
| 44370.75 | 30.68 |
| 44370.760416666664 | 30.67 |
| 44370.770833333336 | 30.65 |
| 44370.78125 | 30.67 |
| 44370.791666666664 | 30.61 |
| 44370.802083333336 | 30.82 |
| 44370.8125 | 30.99 |
| 44370.822916666664 | 31.15 |
| 44370.833333333336 | 31.37 |
| 44370.84375 | 31.55 |
| 44370.854166666664 | 31.57 |
| 44370.864583333336 | 31.65 |
| 44370.875 | 31.73 |
| 44370.885416666664 | 31.82 |
| 44370.895833333336 | 31.93 |
| 44370.90625 | 32 |
| 44370.916666666664 | 32.06 |
| 44370.927083333336 | 32.06 |
| 44370.9375 | 32.09 |
| 44370.947916666664 | 32.11 |
| 44370.958333333336 | 32.11 |
| 44370.96875 | 32.13 |
| 44370.979166666664 | 32.14 |
| 44370.989583333336 | 32.16 |
| 44371.0 | 32.18 |
| 44371.010416666664 | 32.18 |
| 44371.020833333336 | 32.18 |
| 44371.03125 | 32.17 |
| 44371.041666666664 | 32.16 |
| 44371.052083333336 | 32.13 |
| 44371.0625 | 32.12 |
| 44371.072916666664 | 32.1 |
| 44371.083333333336 | 32.15 |
| 44371.09375 | 32.14 |
| 44371.104166666664 | 32.17 |
| 44371.114583333336 | 32.16 |
| 44371.125 | 32.15 |
| 44371.135416666664 | 32.14 |
| 44371.145833333336 | 32.13 |
| 44371.15625 | 32.12 |
| 44371.166666666664 | 32.09 |
| 44371.177083333336 | 32.07 |
| 44371.1875 | 32.06 |
| 44371.197916666664 | 31.97 |
| 44371.208333333336 | 31.94 |
| 44371.21875 | 31.76 |
| 44371.229166666664 | 31.56 |
| 44371.239583333336 | 31.45 |
| 44371.25 | 31.29 |
| 44371.260416666664 | 31.17 |
| 44371.270833333336 | 31.03 |
| 44371.28125 | 30.95 |
| 44371.291666666664 | 30.78 |
| 44371.302083333336 | 30.76 |
| 44371.3125 | 30.85 |
| 44371.322916666664 | 30.87 |
| 44371.333333333336 | 30.84 |
| 44371.34375 | 30.91 |
| 44371.354166666664 | 31.04 |
| 44371.364583333336 | 31.21 |
| 44371.375 | 31.39 |
| 44371.385416666664 | 31.56 |
| 44371.395833333336 | 31.62 |
| 44371.40625 | 31.64 |
| 44371.416666666664 | 31.7 |
| 44371.427083333336 | 31.74 |
| 44371.4375 | 31.79 |
| 44371.447916666664 | 31.83 |
| 44371.458333333336 | 31.87 |
| 44371.46875 | 31.9 |
| 44371.479166666664 | 31.92 |
| 44371.489583333336 | 31.94 |
| 44371.5 | 31.95 |
| 44371.510416666664 | 31.95 |
| 44371.520833333336 | 31.96 |
| 44371.53125 | 31.97 |
| 44371.541666666664 | 31.94 |
| 44371.552083333336 | 31.96 |
| 44371.5625 | 31.94 |
| 44371.572916666664 | 31.97 |
| 44371.583333333336 | 31.97 |
| 44371.59375 | 31.97 |
| 44371.604166666664 | 31.92 |
| 44371.614583333336 | 31.95 |
| 44371.625 | 31.91 |
| 44371.635416666664 | 31.9 |
| 44371.645833333336 | 31.9 |
| 44371.65625 | 31.83 |
| 44371.666666666664 | 31.85 |
| 44371.677083333336 | 31.74 |
| 44371.6875 | 31.69 |
| 44371.697916666664 | 31.69 |
| 44371.708333333336 | 31.68 |
| 44371.71875 | 31.58 |
| 44371.729166666664 | 31.54 |
| 44371.739583333336 | 31.45 |
| 44371.75 | 31.33 |
| 44371.760416666664 | 31.2 |
| 44371.770833333336 | 31.3 |
| 44371.78125 | 31.28 |
| 44371.791666666664 | 31.27 |
| 44371.802083333336 | 31.28 |
| 44371.8125 | 31.31 |
| 44371.822916666664 | 31.19 |
| 44371.833333333336 | 31.17 |
| 44371.84375 | 31.22 |
| 44371.854166666664 | 31.34 |
| 44371.864583333336 | 31.57 |
| 44371.875 | 31.69 |
| 44371.885416666664 | 31.76 |
| 44371.895833333336 | 31.79 |
| 44371.90625 | 31.89 |
| 44371.916666666664 | 31.99 |
| 44371.927083333336 | 32.08 |
| 44371.9375 | 32.17 |
| 44371.947916666664 | 32.2 |
| 44371.958333333336 | 32.21 |
| 44371.96875 | 32.21 |
| 44371.979166666664 | 32.21 |
| 44371.989583333336 | 32.2 |
| 44372.0 | 32.2 |
| 44372.010416666664 | 32.18 |
| 44372.020833333336 | 32.19 |
| 44372.03125 | 32.2 |
| 44372.041666666664 | 32.21 |
| 44372.052083333336 | 32.22 |
| 44372.0625 | 32.22 |
| 44372.072916666664 | 32.18 |
| 44372.083333333336 | 32.16 |
| 44372.09375 | 32.17 |
| 44372.104166666664 | 32.19 |
| 44372.114583333336 | 32.2 |
| 44372.125 | 32.17 |
| 44372.135416666664 | 32.25 |
| 44372.145833333336 | 32.24 |
| 44372.15625 | 32.25 |
| 44372.166666666664 | 32.22 |
| 44372.177083333336 | 32.24 |
| 44372.1875 | 32.28 |
| 44372.197916666664 | 32.26 |
| 44372.208333333336 | 32.26 |
| 44372.21875 | 32.24 |
| 44372.229166666664 | 32.25 |
| 44372.239583333336 | 32.21 |
| 44372.25 | 32.17 |
| 44372.260416666664 | 32.09 |
| 44372.270833333336 | 31.97 |
| 44372.28125 | 31.99 |
| 44372.291666666664 | 31.78 |
| 44372.302083333336 | 31.67 |
| 44372.3125 | 31.6 |
| 44372.322916666664 | 31.54 |
| 44372.333333333336 | 31.45 |
| 44372.34375 | 31.42 |
| 44372.354166666664 | 31.56 |
| 44372.364583333336 | 31.46 |
| 44372.375 | 31.51 |
| 44372.385416666664 | 31.6 |
| 44372.395833333336 | 31.67 |
| 44372.40625 | 31.78 |
| 44372.416666666664 | 31.9 |
| 44372.427083333336 | 32 |
| 44372.4375 | 32.03 |
| 44372.447916666664 | 32.05 |
| 44372.458333333336 | 32.07 |
| 44372.46875 | 32.09 |
| 44372.479166666664 | 32.13 |
| 44372.489583333336 | 32.15 |
| 44372.5 | 32.17 |
| 44372.510416666664 | 32.18 |
| 44372.520833333336 | 32.19 |
| 44372.53125 | 32.2 |
| 44372.541666666664 | 32.18 |
| 44372.552083333336 | 32.21 |
| 44372.5625 | 32.2 |
| 44372.572916666664 | 32.2 |
| 44372.583333333336 | 32.16 |
| 44372.59375 | 32.17 |
| 44372.604166666664 | 32.2 |
| 44372.614583333336 | 32.19 |
| 44372.625 | 32.2 |
| 44372.635416666664 | 32.15 |
| 44372.645833333336 | 32.08 |
| 44372.65625 | 32.16 |
| 44372.666666666664 | 32.13 |
| 44372.677083333336 | 32.12 |
| 44372.6875 | 32.12 |
| 44372.697916666664 | 32.13 |
| 44372.708333333336 | 32.02 |
| 44372.71875 | 32.01 |
| 44372.729166666664 | 31.96 |
| 44372.739583333336 | 31.91 |
| 44372.75 | 31.91 |
| 44372.760416666664 | 31.81 |
| 44372.770833333336 | 31.78 |
| 44372.78125 | 31.71 |
| 44372.791666666664 | 31.63 |
| 44372.802083333336 | 31.64 |
| 44372.8125 | 31.62 |
| 44372.822916666664 | 31.53 |
| 44372.833333333336 | 31.51 |
| 44372.84375 | 31.52 |
| 44372.854166666664 | 31.52 |
| 44372.864583333336 | 31.47 |
| 44372.875 | 31.49 |
| 44372.885416666664 | 31.6 |
| 44372.895833333336 | 31.71 |
| 44372.90625 | 31.82 |
| 44372.916666666664 | 31.9 |
| 44372.927083333336 | 32.05 |
| 44372.9375 | 32.01 |
| 44372.947916666664 | 32.05 |
| 44372.958333333336 | 32.17 |
| 44372.96875 | 32.11 |
| 44372.979166666664 | 32.22 |
| 44372.989583333336 | 32.16 |
| 44373.0 | 32.28 |
| 44373.010416666664 | 32.18 |
| 44373.020833333336 | 32.23 |
| 44373.03125 | 32.16 |
| 44373.041666666664 | 32.19 |
| 44373.052083333336 | 32.19 |
| 44373.0625 | 32.21 |
| 44373.072916666664 | 32.35 |
| 44373.083333333336 | 32.3 |
| 44373.09375 | 32.3 |
| 44373.104166666664 | 32.29 |
| 44373.114583333336 | 32.26 |
| 44373.125 | 32.21 |
| 44373.135416666664 | 32.15 |
| 44373.145833333336 | 32.23 |
| 44373.15625 | 32.17 |
| 44373.166666666664 | 32.16 |
| 44373.177083333336 | 32.21 |
| 44373.1875 | 32.18 |
| 44373.197916666664 | 32.2 |
| 44373.208333333336 | 32.2 |
| 44373.21875 | 32.18 |
| 44373.229166666664 | 32.18 |
| 44373.239583333336 | 32.2 |
| 44373.25 | 32.19 |
| 44373.260416666664 | 32.18 |
| 44373.270833333336 | 32.16 |
| 44373.28125 | 32.12 |
| 44373.291666666664 | 32.07 |
| 44373.302083333336 | 32.01 |
| 44373.3125 | 31.92 |
| 44373.322916666664 | 31.83 |
| 44373.333333333336 | 31.73 |
| 44373.34375 | 31.62 |
| 44373.354166666664 | 31.54 |
| 44373.364583333336 | 31.46 |
| 44373.375 | 31.45 |
| 44373.385416666664 | 31.5 |
| 44373.395833333336 | 31.52 |
| 44373.40625 | 31.55 |
| 44373.416666666664 | 31.59 |
| 44373.427083333336 | 31.66 |
| 44373.4375 | 31.76 |
| 44373.447916666664 | 31.81 |
| 44373.458333333336 | 31.88 |
| 44373.46875 | 31.93 |
| 44373.479166666664 | 32.04 |
| 44373.489583333336 | 32.03 |
| 44373.5 | 32.09 |
| 44373.510416666664 | 32.13 |
| 44373.520833333336 | 32.13 |
| 44373.53125 | 32.15 |
| 44373.541666666664 | 32.17 |
| 44373.552083333336 | 32.18 |
| 44373.5625 | 32.18 |
| 44373.572916666664 | 32.18 |
| 44373.583333333336 | 32.23 |
| 44373.59375 | 32.2 |
| 44373.604166666664 | 32.22 |
| 44373.614583333336 | 32.21 |
| 44373.625 | 32.15 |
| 44373.635416666664 | 32.08 |
| 44373.645833333336 | 32.14 |
| 44373.65625 | 32.14 |
| 44373.666666666664 | 32.17 |
| 44373.677083333336 | 32.18 |
| 44373.6875 | 32.17 |
| 44373.697916666664 | 32.16 |
| 44373.708333333336 | 32.12 |
| 44373.71875 | 32.12 |
| 44373.729166666664 | 32.13 |
| 44373.739583333336 | 32.11 |
| 44373.75 | 32.09 |
| 44373.760416666664 | 32.07 |
| 44373.770833333336 | 32.06 |
| 44373.78125 | 32.04 |
| 44373.791666666664 | 31.98 |
| 44373.802083333336 | 31.88 |
| 44373.8125 | 31.85 |
| 44373.822916666664 | 31.73 |
| 44373.833333333336 | 31.69 |
| 44373.84375 | 31.64 |
| 44373.854166666664 | 31.6 |
| 44373.864583333336 | 31.58 |
| 44373.875 | 31.58 |
| 44373.885416666664 | 31.67 |
| 44373.895833333336 | 31.63 |
| 44373.90625 | 31.67 |
| 44373.916666666664 | 31.8 |
| 44373.927083333336 | 31.93 |
| 44373.9375 | 32.05 |
| 44373.947916666664 | 32.09 |
| 44373.958333333336 | 32.15 |
| 44373.96875 | 32.21 |
| 44373.979166666664 | 32.26 |
| 44373.989583333336 | 32.3 |
| 44374.0 | 32.34 |
| 44374.010416666664 | 32.38 |
| 44374.020833333336 | 32.37 |
| 44374.03125 | 32.38 |
| 44374.041666666664 | 32.39 |
| 44374.052083333336 | 32.38 |
| 44374.0625 | 32.36 |
| 44374.072916666664 | 32.39 |
| 44374.083333333336 | 32.4 |
| 44374.09375 | 32.4 |
| 44374.104166666664 | 32.42 |
| 44374.114583333336 | 32.39 |
| 44374.125 | 32.45 |
| 44374.135416666664 | 32.47 |
| 44374.145833333336 | 32.45 |
| 44374.15625 | 32.44 |
| 44374.166666666664 | 32.39 |
| 44374.177083333336 | 32.35 |
| 44374.1875 | 32.35 |
| 44374.197916666664 | 32.43 |
| 44374.208333333336 | 32.44 |
| 44374.21875 | 32.47 |
| 44374.229166666664 | 32.48 |
| 44374.239583333336 | 32.48 |
| 44374.25 | 32.43 |
| 44374.260416666664 | 32.39 |
| 44374.270833333336 | 32.35 |
| 44374.28125 | 32.39 |
| 44374.291666666664 | 32.35 |
| 44374.302083333336 | 32.32 |
| 44374.3125 | 32.28 |
| 44374.322916666664 | 32.24 |
| 44374.333333333336 | 32.16 |
| 44374.34375 | 32.09 |
| 44374.354166666664 | 32 |
| 44374.364583333336 | 31.9 |
| 44374.375 | 31.81 |
| 44374.385416666664 | 31.73 |
| 44374.395833333336 | 31.66 |
| 44374.40625 | 31.63 |
| 44374.416666666664 | 31.7 |
| 44374.427083333336 | 31.73 |
| 44374.4375 | 31.74 |
| 44374.447916666664 | 31.75 |
| 44374.458333333336 | 31.81 |
| 44374.46875 | 31.92 |
| 44374.479166666664 | 32.02 |
| 44374.489583333336 | 32.07 |
| 44374.5 | 32.15 |
| 44374.510416666664 | 32.18 |
| 44374.520833333336 | 32.2 |
| 44374.53125 | 32.29 |
| 44374.541666666664 | 32.27 |
| 44374.552083333336 | 32.3 |
| 44374.5625 | 32.32 |
| 44374.572916666664 | 32.34 |
| 44374.583333333336 | 32.35 |
| 44374.59375 | 32.34 |
| 44374.604166666664 | 32.32 |
| 44374.614583333336 | 32.3 |
| 44374.625 | 32.32 |
| 44374.635416666664 | 32.33 |
| 44374.645833333336 | 32.35 |
| 44374.65625 | 32.35 |
| 44374.666666666664 | 32.28 |
| 44374.677083333336 | 32.32 |
| 44374.6875 | 32.39 |
| 44374.697916666664 | 32.32 |
| 44374.708333333336 | 32.31 |
| 44374.71875 | 32.41 |
| 44374.729166666664 | 32.38 |
| 44374.739583333336 | 32.39 |
| 44374.75 | 32.35 |
| 44374.760416666664 | 32.39 |
| 44374.770833333336 | 32.36 |
| 44374.78125 | 32.36 |
| 44374.791666666664 | 32.29 |
| 44374.802083333336 | 32.32 |
| 44374.8125 | 32.27 |
| 44374.822916666664 | 32.23 |
| 44374.833333333336 | 32.17 |
| 44374.84375 | 32.11 |
| 44374.854166666664 | 32.05 |
| 44374.864583333336 | 31.94 |
| 44374.875 | 31.99 |
| 44374.885416666664 | 31.87 |
| 44374.895833333336 | 31.83 |
| 44374.90625 | 31.83 |
| 44374.916666666664 | 31.88 |
| 44374.927083333336 | 31.85 |
| 44374.9375 | 31.89 |
| 44374.947916666664 | 31.92 |
| 44374.958333333336 | 32.07 |
| 44374.96875 | 32.15 |
| 44374.979166666664 | 32.24 |
| 44374.989583333336 | 32.29 |
| 44375.0 | 32.33 |
| 44375.010416666664 | 32.37 |
| 44375.020833333336 | 32.42 |
| 44375.03125 | 32.45 |
| 44375.041666666664 | 32.48 |
| 44375.052083333336 | 32.52 |
| 44375.0625 | 32.55 |
| 44375.072916666664 | 32.55 |
| 44375.083333333336 | 32.57 |
| 44375.09375 | 32.52 |
| 44375.104166666664 | 32.46 |
| 44375.114583333336 | 32.52 |
| 44375.125 | 32.62 |
| 44375.135416666664 | 32.56 |
| 44375.145833333336 | 32.57 |
| 44375.15625 | 32.58 |
| 44375.166666666664 | 32.53 |
| 44375.177083333336 | 32.56 |
| 44375.1875 | 32.51 |
| 44375.197916666664 | 32.49 |
| 44375.208333333336 | 32.48 |
| 44375.21875 | 32.45 |
| 44375.229166666664 | 32.47 |
| 44375.239583333336 | 32.5 |
| 44375.25 | 32.5 |
| 44375.260416666664 | 32.52 |
| 44375.270833333336 | 32.55 |
| 44375.28125 | 32.56 |
| 44375.291666666664 | 32.59 |
| 44375.302083333336 | 32.56 |
| 44375.3125 | 32.53 |
| 44375.322916666664 | 32.51 |
| 44375.333333333336 | 32.49 |
| 44375.34375 | 32.43 |
| 44375.354166666664 | 32.39 |
| 44375.364583333336 | 32.32 |
| 44375.375 | 32.25 |
| 44375.385416666664 | 32.13 |
| 44375.395833333336 | 32.08 |
| 44375.40625 | 32.05 |
| 44375.416666666664 | 31.96 |
| 44375.427083333336 | 31.92 |
| 44375.4375 | 31.93 |
| 44375.447916666664 | 31.96 |
| 44375.458333333336 | 32.02 |
| 44375.46875 | 31.98 |
| 44375.479166666664 | 32.03 |
| 44375.489583333336 | 32.07 |
| 44375.5 | 32.16 |
| 44375.510416666664 | 32.23 |
| 44375.520833333336 | 32.35 |
| 44375.53125 | 32.33 |
| 44375.541666666664 | 32.39 |
| 44375.552083333336 | 32.41 |
| 44375.5625 | 32.44 |
| 44375.572916666664 | 32.57 |
| 44375.583333333336 | 32.54 |
| 44375.59375 | 32.56 |
| 44375.604166666664 | 32.57 |
| 44375.614583333336 | 32.55 |
| 44375.625 | 32.52 |
| 44375.635416666664 | 32.59 |
| 44375.645833333336 | 32.53 |
| 44375.65625 | 32.52 |
| 44375.666666666664 | 32.52 |
| 44375.677083333336 | 32.58 |
| 44375.6875 | 32.53 |
| 44375.697916666664 | 32.55 |
| 44375.708333333336 | 32.53 |
| 44375.71875 | 32.55 |
| 44375.729166666664 | 32.65 |
| 44375.739583333336 | 32.66 |
| 44375.75 | 32.78 |
| 44375.760416666664 | 32.69 |
| 44375.770833333336 | 32.72 |
| 44375.78125 | 32.79 |
| 44375.791666666664 | 32.76 |
| 44375.802083333336 | 32.73 |
| 44375.8125 | 32.69 |
| 44375.822916666664 | 32.68 |
| 44375.833333333336 | 32.65 |
| 44375.84375 | 32.64 |
| 44375.854166666664 | 32.61 |
| 44375.864583333336 | 32.6 |
| 44375.875 | 32.53 |
| 44375.885416666664 | 32.39 |
| 44375.895833333336 | 32.38 |
| 44375.90625 | 32.3 |
| 44375.916666666664 | 32.23 |
| 44375.927083333336 | 32.16 |
| 44375.9375 | 32.13 |
| 44375.947916666664 | 32.18 |
| 44375.958333333336 | 32.22 |
| 44375.96875 | 32.2 |
| 44375.979166666664 | 32.21 |
| 44375.989583333336 | 32.26 |
| 44376.0 | 32.36 |
| 44376.010416666664 | 32.43 |
| 44376.020833333336 | 32.48 |
| 44376.03125 | 32.56 |
| 44376.041666666664 | 32.6 |
| 44376.052083333336 | 32.63 |
| 44376.0625 | 32.64 |
| 44376.072916666664 | 32.71 |
| 44376.083333333336 | 32.75 |
| 44376.09375 | 32.8 |
| 44376.104166666664 | 32.8 |
| 44376.114583333336 | 32.8 |
| 44376.125 | 32.73 |
| 44376.135416666664 | 32.71 |
| 44376.145833333336 | 32.62 |
| 44376.15625 | 32.66 |
| 44376.166666666664 | 32.65 |
| 44376.177083333336 | 32.65 |
| 44376.1875 | 32.66 |
| 44376.197916666664 | 32.68 |
| 44376.208333333336 | 32.69 |
| 44376.21875 | 32.69 |
| 44376.229166666664 | 32.67 |
| 44376.239583333336 | 32.67 |
| 44376.25 | 32.67 |
| 44376.260416666664 | 32.7 |
| 44376.270833333336 | 32.69 |
| 44376.28125 | 32.72 |
| 44376.291666666664 | 32.72 |
| 44376.302083333336 | 32.7 |
| 44376.3125 | 32.73 |
| 44376.322916666664 | 32.76 |
| 44376.333333333336 | 32.71 |
| 44376.34375 | 32.69 |
| 44376.354166666664 | 32.59 |
| 44376.364583333336 | 32.55 |
| 44376.375 | 32.5 |
| 44376.385416666664 | 32.46 |
| 44376.395833333336 | 32.42 |
| 44376.40625 | 32.38 |
| 44376.416666666664 | 32.42 |
| 44376.427083333336 | 32.33 |
| 44376.4375 | 32.29 |
| 44376.447916666664 | 32.24 |
| 44376.458333333336 | 32.23 |
| 44376.46875 | 32.22 |
| 44376.479166666664 | 32.24 |
| 44376.489583333336 | 32.26 |
| 44376.5 | 32.23 |
| 44376.510416666664 | 32.23 |
| 44376.520833333336 | 32.27 |
| 44376.53125 | 32.3 |
| 44376.541666666664 | 32.36 |
| 44376.552083333336 | 32.42 |
| 44376.5625 | 32.45 |
| 44376.572916666664 | 32.49 |
| 44376.583333333336 | 32.53 |
| 44376.59375 | 32.57 |
| 44376.604166666664 | 32.61 |
| 44376.614583333336 | 32.64 |
| 44376.625 | 32.67 |
| 44376.635416666664 | 32.68 |
| 44376.645833333336 | 32.68 |
| 44376.65625 | 32.68 |
| 44376.666666666664 | 32.63 |
| 44376.677083333336 | 32.62 |
| 44376.6875 | 32.61 |
| 44376.697916666664 | 32.57 |
| 44376.708333333336 | 32.58 |
| 44376.71875 | 32.58 |
| 44376.729166666664 | 32.59 |
| 44376.739583333336 | 32.58 |
| 44376.75 | 32.59 |
| 44376.760416666664 | 32.62 |
| 44376.770833333336 | 32.67 |
| 44376.78125 | 32.78 |
| 44376.791666666664 | 32.76 |
| 44376.802083333336 | 32.84 |
| 44376.8125 | 32.84 |
| 44376.822916666664 | 32.78 |
| 44376.833333333336 | 32.8 |
| 44376.84375 | 32.78 |
| 44376.854166666664 | 32.76 |
| 44376.864583333336 | 32.73 |
| 44376.875 | 32.63 |
| 44376.885416666664 | 32.65 |
| 44376.895833333336 | 32.64 |
| 44376.90625 | 32.66 |
| 44376.916666666664 | 32.59 |
| 44376.927083333336 | 32.62 |
| 44376.9375 | 32.5 |
| 44376.947916666664 | 32.44 |
| 44376.958333333336 | 32.36 |
| 44376.96875 | 32.34 |
| 44376.979166666664 | 32.34 |
| 44376.989583333336 | 32.38 |
| 44377.0 | 32.43 |
| 44377.010416666664 | 32.41 |
| 44377.020833333336 | 32.47 |
| 44377.03125 | 32.51 |
| 44377.041666666664 | 32.58 |
| 44377.052083333336 | 32.67 |
| 44377.0625 | 32.73 |
| 44377.072916666664 | 32.79 |
| 44377.083333333336 | 32.83 |
| 44377.09375 | 32.88 |
| 44377.104166666664 | 32.93 |
| 44377.114583333336 | 32.99 |
| 44377.125 | 33.04 |
| 44377.135416666664 | 33.06 |
| 44377.145833333336 | 33.06 |
| 44377.15625 | 33.01 |
| 44377.166666666664 | 32.9 |
| 44377.177083333336 | 32.86 |
| 44377.1875 | 32.83 |
| 44377.197916666664 | 32.8 |
| 44377.208333333336 | 32.78 |
| 44377.21875 | 32.83 |
| 44377.229166666664 | 32.78 |
| 44377.239583333336 | 32.78 |
| 44377.25 | 32.85 |
| 44377.260416666664 | 32.78 |
| 44377.270833333336 | 32.8 |
| 44377.28125 | 32.76 |
| 44377.291666666664 | 32.78 |
| 44377.302083333336 | 32.87 |
| 44377.3125 | 32.83 |
| 44377.322916666664 | 32.86 |
| 44377.333333333336 | 32.88 |
| 44377.34375 | 32.94 |
| 44377.354166666664 | 32.9 |
| 44377.364583333336 | 32.86 |
| 44377.375 | 32.79 |
| 44377.385416666664 | 32.72 |
| 44377.395833333336 | 32.65 |
| 44377.40625 | 32.61 |
| 44377.416666666664 | 32.57 |
| 44377.427083333336 | 32.54 |
| 44377.4375 | 32.48 |
| 44377.447916666664 | 32.44 |
| 44377.458333333336 | 32.42 |
| 44377.46875 | 32.39 |
| 44377.479166666664 | 32.38 |
| 44377.489583333336 | 32.38 |
| 44377.5 | 32.38 |
| 44377.510416666664 | 32.39 |
| 44377.520833333336 | 32.42 |
| 44377.53125 | 32.38 |
| 44377.541666666664 | 32.41 |
| 44377.552083333336 | 32.44 |
| 44377.5625 | 32.48 |
| 44377.572916666664 | 32.58 |
| 44377.583333333336 | 32.66 |
| 44377.59375 | 32.72 |
| 44377.604166666664 | 32.77 |
| 44377.614583333336 | 32.83 |
| 44377.625 | 32.88 |
| 44377.635416666664 | 32.92 |
| 44377.645833333336 | 32.94 |
| 44377.65625 | 32.97 |
| 44377.666666666664 | 32.96 |
| 44377.677083333336 | 32.92 |
| 44377.6875 | 32.86 |
| 44377.697916666664 | 32.87 |
| 44377.708333333336 | 32.81 |
| 44377.71875 | 32.8 |
| 44377.729166666664 | 32.8 |
| 44377.739583333336 | 32.8 |
| 44377.75 | 32.79 |
| 44377.760416666664 | 32.81 |
| 44377.770833333336 | 32.84 |
| 44377.78125 | 32.82 |
| 44377.791666666664 | 32.84 |
| 44377.802083333336 | 32.92 |
| 44377.8125 | 32.91 |
| 44377.822916666664 | 32.89 |
| 44377.833333333336 | 32.9 |
| 44377.84375 | 33.07 |
| 44377.854166666664 | 33.01 |
| 44377.864583333336 | 33.11 |
| 44377.875 | 33.12 |
| 44377.885416666664 | 33.05 |
| 44377.895833333336 | 33.01 |
| 44377.90625 | 33.07 |
| 44377.916666666664 | 33.15 |
| 44377.927083333336 | 33.03 |
| 44377.9375 | 33.03 |
| 44377.947916666664 | 32.93 |
| 44377.958333333336 | 32.88 |
| 44377.96875 | 32.83 |
| 44377.979166666664 | 32.8 |
| 44377.989583333336 | 32.84 |
| 44378.0 | 32.81 |
| 44378.010416666664 | 32.79 |
| 44378.020833333336 | 32.8 |
| 44378.03125 | 32.84 |
| 44378.041666666664 | 32.86 |
| 44378.052083333336 | 32.85 |
| 44378.0625 | 32.88 |
| 44378.072916666664 | 32.95 |
| 44378.083333333336 | 33.04 |
| 44378.09375 | 33.1 |
| 44378.104166666664 | 33.1 |
| 44378.114583333336 | 33.15 |
| 44378.125 | 33.18 |
| 44378.135416666664 | 33.21 |
| 44378.145833333336 | 33.24 |
| 44378.15625 | 33.26 |